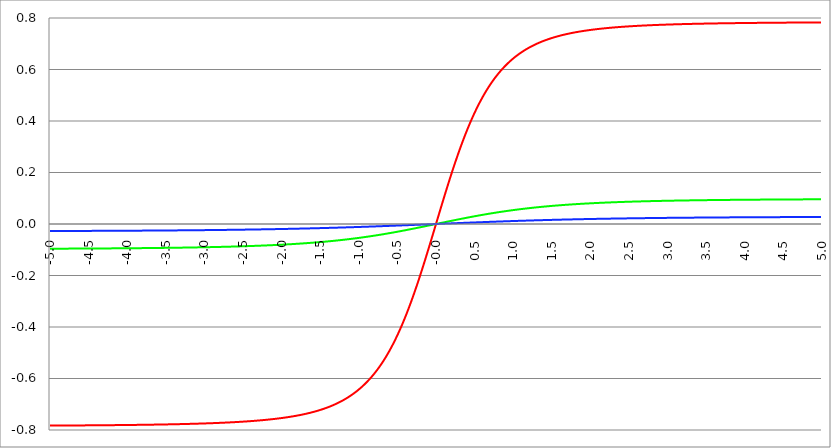
| Category | Series 1 | Series 0 | Series 2 |
|---|---|---|---|
| -5.0 | -0.783 | -0.096 | -0.027 |
| -4.995 | -0.783 | -0.096 | -0.027 |
| -4.99 | -0.783 | -0.096 | -0.027 |
| -4.985 | -0.783 | -0.096 | -0.027 |
| -4.98 | -0.783 | -0.096 | -0.027 |
| -4.975 | -0.783 | -0.096 | -0.027 |
| -4.97 | -0.783 | -0.096 | -0.027 |
| -4.965000000000001 | -0.783 | -0.096 | -0.027 |
| -4.960000000000001 | -0.783 | -0.096 | -0.027 |
| -4.955000000000001 | -0.783 | -0.096 | -0.027 |
| -4.950000000000001 | -0.783 | -0.096 | -0.027 |
| -4.945000000000001 | -0.783 | -0.096 | -0.027 |
| -4.940000000000001 | -0.783 | -0.096 | -0.027 |
| -4.935000000000001 | -0.783 | -0.096 | -0.027 |
| -4.930000000000001 | -0.783 | -0.096 | -0.027 |
| -4.925000000000002 | -0.783 | -0.096 | -0.027 |
| -4.920000000000002 | -0.783 | -0.096 | -0.027 |
| -4.915000000000002 | -0.783 | -0.096 | -0.027 |
| -4.910000000000002 | -0.783 | -0.096 | -0.027 |
| -4.905000000000002 | -0.783 | -0.096 | -0.027 |
| -4.900000000000002 | -0.783 | -0.096 | -0.027 |
| -4.895000000000002 | -0.783 | -0.096 | -0.027 |
| -4.890000000000002 | -0.783 | -0.096 | -0.027 |
| -4.885000000000002 | -0.783 | -0.096 | -0.027 |
| -4.880000000000002 | -0.783 | -0.096 | -0.027 |
| -4.875000000000003 | -0.783 | -0.096 | -0.027 |
| -4.870000000000003 | -0.783 | -0.096 | -0.027 |
| -4.865000000000003 | -0.783 | -0.096 | -0.027 |
| -4.860000000000003 | -0.783 | -0.096 | -0.027 |
| -4.855000000000003 | -0.783 | -0.096 | -0.027 |
| -4.850000000000003 | -0.783 | -0.096 | -0.027 |
| -4.845000000000003 | -0.783 | -0.096 | -0.027 |
| -4.840000000000003 | -0.783 | -0.096 | -0.027 |
| -4.835000000000003 | -0.783 | -0.096 | -0.027 |
| -4.830000000000004 | -0.783 | -0.096 | -0.027 |
| -4.825000000000004 | -0.783 | -0.096 | -0.027 |
| -4.820000000000004 | -0.783 | -0.096 | -0.027 |
| -4.815000000000004 | -0.783 | -0.096 | -0.027 |
| -4.810000000000004 | -0.783 | -0.096 | -0.027 |
| -4.805000000000004 | -0.783 | -0.096 | -0.027 |
| -4.800000000000004 | -0.783 | -0.096 | -0.027 |
| -4.795000000000004 | -0.783 | -0.096 | -0.027 |
| -4.790000000000004 | -0.783 | -0.096 | -0.027 |
| -4.785000000000004 | -0.783 | -0.096 | -0.027 |
| -4.780000000000004 | -0.782 | -0.096 | -0.027 |
| -4.775000000000004 | -0.782 | -0.096 | -0.027 |
| -4.770000000000004 | -0.782 | -0.096 | -0.027 |
| -4.765000000000005 | -0.782 | -0.096 | -0.027 |
| -4.760000000000005 | -0.782 | -0.096 | -0.027 |
| -4.755000000000005 | -0.782 | -0.096 | -0.027 |
| -4.750000000000005 | -0.782 | -0.096 | -0.027 |
| -4.745000000000005 | -0.782 | -0.096 | -0.027 |
| -4.740000000000005 | -0.782 | -0.096 | -0.027 |
| -4.735000000000005 | -0.782 | -0.096 | -0.027 |
| -4.730000000000005 | -0.782 | -0.096 | -0.027 |
| -4.725000000000006 | -0.782 | -0.096 | -0.027 |
| -4.720000000000006 | -0.782 | -0.096 | -0.027 |
| -4.715000000000006 | -0.782 | -0.096 | -0.027 |
| -4.710000000000006 | -0.782 | -0.096 | -0.027 |
| -4.705000000000006 | -0.782 | -0.096 | -0.027 |
| -4.700000000000006 | -0.782 | -0.096 | -0.027 |
| -4.695000000000006 | -0.782 | -0.096 | -0.027 |
| -4.690000000000006 | -0.782 | -0.096 | -0.027 |
| -4.685000000000007 | -0.782 | -0.096 | -0.027 |
| -4.680000000000007 | -0.782 | -0.096 | -0.027 |
| -4.675000000000007 | -0.782 | -0.096 | -0.027 |
| -4.670000000000007 | -0.782 | -0.096 | -0.027 |
| -4.665000000000007 | -0.782 | -0.095 | -0.027 |
| -4.660000000000007 | -0.782 | -0.095 | -0.027 |
| -4.655000000000007 | -0.782 | -0.095 | -0.027 |
| -4.650000000000007 | -0.782 | -0.095 | -0.027 |
| -4.645000000000007 | -0.782 | -0.095 | -0.027 |
| -4.640000000000008 | -0.782 | -0.095 | -0.027 |
| -4.635000000000008 | -0.782 | -0.095 | -0.027 |
| -4.630000000000008 | -0.782 | -0.095 | -0.027 |
| -4.625000000000008 | -0.782 | -0.095 | -0.027 |
| -4.620000000000008 | -0.782 | -0.095 | -0.027 |
| -4.615000000000008 | -0.782 | -0.095 | -0.027 |
| -4.610000000000008 | -0.782 | -0.095 | -0.027 |
| -4.605000000000008 | -0.782 | -0.095 | -0.027 |
| -4.600000000000008 | -0.782 | -0.095 | -0.027 |
| -4.595000000000009 | -0.782 | -0.095 | -0.027 |
| -4.590000000000009 | -0.782 | -0.095 | -0.027 |
| -4.585000000000009 | -0.782 | -0.095 | -0.027 |
| -4.580000000000009 | -0.782 | -0.095 | -0.027 |
| -4.57500000000001 | -0.782 | -0.095 | -0.027 |
| -4.57000000000001 | -0.782 | -0.095 | -0.027 |
| -4.565000000000009 | -0.782 | -0.095 | -0.027 |
| -4.560000000000009 | -0.782 | -0.095 | -0.027 |
| -4.555000000000009 | -0.782 | -0.095 | -0.027 |
| -4.55000000000001 | -0.782 | -0.095 | -0.027 |
| -4.54500000000001 | -0.782 | -0.095 | -0.027 |
| -4.54000000000001 | -0.782 | -0.095 | -0.027 |
| -4.53500000000001 | -0.782 | -0.095 | -0.027 |
| -4.53000000000001 | -0.782 | -0.095 | -0.027 |
| -4.52500000000001 | -0.782 | -0.095 | -0.027 |
| -4.52000000000001 | -0.782 | -0.095 | -0.027 |
| -4.51500000000001 | -0.782 | -0.095 | -0.027 |
| -4.51000000000001 | -0.782 | -0.095 | -0.027 |
| -4.505000000000011 | -0.782 | -0.095 | -0.027 |
| -4.500000000000011 | -0.782 | -0.095 | -0.027 |
| -4.495000000000011 | -0.782 | -0.095 | -0.027 |
| -4.490000000000011 | -0.782 | -0.095 | -0.027 |
| -4.485000000000011 | -0.782 | -0.095 | -0.027 |
| -4.480000000000011 | -0.782 | -0.095 | -0.027 |
| -4.475000000000011 | -0.782 | -0.095 | -0.027 |
| -4.470000000000011 | -0.782 | -0.095 | -0.027 |
| -4.465000000000011 | -0.782 | -0.095 | -0.027 |
| -4.460000000000011 | -0.782 | -0.095 | -0.027 |
| -4.455000000000012 | -0.782 | -0.095 | -0.027 |
| -4.450000000000012 | -0.782 | -0.095 | -0.027 |
| -4.445000000000012 | -0.782 | -0.095 | -0.027 |
| -4.440000000000012 | -0.782 | -0.095 | -0.027 |
| -4.435000000000012 | -0.782 | -0.095 | -0.027 |
| -4.430000000000012 | -0.782 | -0.095 | -0.027 |
| -4.425000000000012 | -0.782 | -0.095 | -0.027 |
| -4.420000000000012 | -0.782 | -0.095 | -0.027 |
| -4.415000000000012 | -0.782 | -0.095 | -0.027 |
| -4.410000000000013 | -0.782 | -0.095 | -0.027 |
| -4.405000000000013 | -0.782 | -0.095 | -0.027 |
| -4.400000000000013 | -0.782 | -0.095 | -0.027 |
| -4.395000000000013 | -0.782 | -0.095 | -0.027 |
| -4.390000000000013 | -0.782 | -0.095 | -0.027 |
| -4.385000000000013 | -0.782 | -0.095 | -0.027 |
| -4.380000000000013 | -0.782 | -0.095 | -0.027 |
| -4.375000000000013 | -0.782 | -0.095 | -0.027 |
| -4.370000000000013 | -0.782 | -0.095 | -0.027 |
| -4.365000000000013 | -0.782 | -0.095 | -0.027 |
| -4.360000000000014 | -0.782 | -0.095 | -0.027 |
| -4.355000000000014 | -0.782 | -0.095 | -0.027 |
| -4.350000000000014 | -0.782 | -0.095 | -0.027 |
| -4.345000000000014 | -0.782 | -0.095 | -0.027 |
| -4.340000000000014 | -0.782 | -0.095 | -0.027 |
| -4.335000000000014 | -0.782 | -0.095 | -0.027 |
| -4.330000000000014 | -0.782 | -0.095 | -0.027 |
| -4.325000000000014 | -0.782 | -0.095 | -0.027 |
| -4.320000000000014 | -0.782 | -0.095 | -0.027 |
| -4.315000000000015 | -0.782 | -0.095 | -0.027 |
| -4.310000000000015 | -0.781 | -0.095 | -0.027 |
| -4.305000000000015 | -0.781 | -0.095 | -0.027 |
| -4.300000000000015 | -0.781 | -0.095 | -0.026 |
| -4.295000000000015 | -0.781 | -0.095 | -0.026 |
| -4.290000000000015 | -0.781 | -0.095 | -0.026 |
| -4.285000000000015 | -0.781 | -0.095 | -0.026 |
| -4.280000000000015 | -0.781 | -0.095 | -0.026 |
| -4.275000000000015 | -0.781 | -0.095 | -0.026 |
| -4.270000000000015 | -0.781 | -0.095 | -0.026 |
| -4.265000000000016 | -0.781 | -0.095 | -0.026 |
| -4.260000000000016 | -0.781 | -0.095 | -0.026 |
| -4.255000000000016 | -0.781 | -0.095 | -0.026 |
| -4.250000000000016 | -0.781 | -0.095 | -0.026 |
| -4.245000000000016 | -0.781 | -0.095 | -0.026 |
| -4.240000000000016 | -0.781 | -0.095 | -0.026 |
| -4.235000000000016 | -0.781 | -0.095 | -0.026 |
| -4.230000000000016 | -0.781 | -0.095 | -0.026 |
| -4.225000000000017 | -0.781 | -0.095 | -0.026 |
| -4.220000000000017 | -0.781 | -0.095 | -0.026 |
| -4.215000000000017 | -0.781 | -0.095 | -0.026 |
| -4.210000000000017 | -0.781 | -0.095 | -0.026 |
| -4.205000000000017 | -0.781 | -0.095 | -0.026 |
| -4.200000000000017 | -0.781 | -0.095 | -0.026 |
| -4.195000000000017 | -0.781 | -0.095 | -0.026 |
| -4.190000000000017 | -0.781 | -0.095 | -0.026 |
| -4.185000000000017 | -0.781 | -0.095 | -0.026 |
| -4.180000000000017 | -0.781 | -0.095 | -0.026 |
| -4.175000000000018 | -0.781 | -0.095 | -0.026 |
| -4.170000000000018 | -0.781 | -0.095 | -0.026 |
| -4.165000000000018 | -0.781 | -0.095 | -0.026 |
| -4.160000000000018 | -0.781 | -0.095 | -0.026 |
| -4.155000000000018 | -0.781 | -0.095 | -0.026 |
| -4.150000000000018 | -0.781 | -0.095 | -0.026 |
| -4.145000000000018 | -0.781 | -0.095 | -0.026 |
| -4.140000000000018 | -0.781 | -0.095 | -0.026 |
| -4.135000000000018 | -0.781 | -0.095 | -0.026 |
| -4.130000000000019 | -0.781 | -0.095 | -0.026 |
| -4.125000000000019 | -0.781 | -0.094 | -0.026 |
| -4.120000000000019 | -0.781 | -0.094 | -0.026 |
| -4.115000000000019 | -0.781 | -0.094 | -0.026 |
| -4.110000000000019 | -0.781 | -0.094 | -0.026 |
| -4.105000000000019 | -0.781 | -0.094 | -0.026 |
| -4.100000000000019 | -0.781 | -0.094 | -0.026 |
| -4.095000000000019 | -0.781 | -0.094 | -0.026 |
| -4.090000000000019 | -0.781 | -0.094 | -0.026 |
| -4.085000000000019 | -0.781 | -0.094 | -0.026 |
| -4.08000000000002 | -0.781 | -0.094 | -0.026 |
| -4.07500000000002 | -0.781 | -0.094 | -0.026 |
| -4.07000000000002 | -0.781 | -0.094 | -0.026 |
| -4.06500000000002 | -0.781 | -0.094 | -0.026 |
| -4.06000000000002 | -0.781 | -0.094 | -0.026 |
| -4.05500000000002 | -0.781 | -0.094 | -0.026 |
| -4.05000000000002 | -0.781 | -0.094 | -0.026 |
| -4.04500000000002 | -0.781 | -0.094 | -0.026 |
| -4.04000000000002 | -0.781 | -0.094 | -0.026 |
| -4.03500000000002 | -0.781 | -0.094 | -0.026 |
| -4.03000000000002 | -0.781 | -0.094 | -0.026 |
| -4.025000000000021 | -0.781 | -0.094 | -0.026 |
| -4.020000000000021 | -0.781 | -0.094 | -0.026 |
| -4.015000000000021 | -0.781 | -0.094 | -0.026 |
| -4.010000000000021 | -0.781 | -0.094 | -0.026 |
| -4.005000000000021 | -0.781 | -0.094 | -0.026 |
| -4.000000000000021 | -0.781 | -0.094 | -0.026 |
| -3.995000000000021 | -0.781 | -0.094 | -0.026 |
| -3.990000000000021 | -0.781 | -0.094 | -0.026 |
| -3.985000000000022 | -0.781 | -0.094 | -0.026 |
| -3.980000000000022 | -0.78 | -0.094 | -0.026 |
| -3.975000000000022 | -0.78 | -0.094 | -0.026 |
| -3.970000000000022 | -0.78 | -0.094 | -0.026 |
| -3.965000000000022 | -0.78 | -0.094 | -0.026 |
| -3.960000000000022 | -0.78 | -0.094 | -0.026 |
| -3.955000000000022 | -0.78 | -0.094 | -0.026 |
| -3.950000000000022 | -0.78 | -0.094 | -0.026 |
| -3.945000000000022 | -0.78 | -0.094 | -0.026 |
| -3.940000000000023 | -0.78 | -0.094 | -0.026 |
| -3.935000000000023 | -0.78 | -0.094 | -0.026 |
| -3.930000000000023 | -0.78 | -0.094 | -0.026 |
| -3.925000000000023 | -0.78 | -0.094 | -0.026 |
| -3.920000000000023 | -0.78 | -0.094 | -0.026 |
| -3.915000000000023 | -0.78 | -0.094 | -0.026 |
| -3.910000000000023 | -0.78 | -0.094 | -0.026 |
| -3.905000000000023 | -0.78 | -0.094 | -0.026 |
| -3.900000000000023 | -0.78 | -0.094 | -0.026 |
| -3.895000000000023 | -0.78 | -0.094 | -0.026 |
| -3.890000000000024 | -0.78 | -0.094 | -0.026 |
| -3.885000000000024 | -0.78 | -0.094 | -0.026 |
| -3.880000000000024 | -0.78 | -0.094 | -0.026 |
| -3.875000000000024 | -0.78 | -0.094 | -0.026 |
| -3.870000000000024 | -0.78 | -0.094 | -0.026 |
| -3.865000000000024 | -0.78 | -0.094 | -0.026 |
| -3.860000000000024 | -0.78 | -0.094 | -0.026 |
| -3.855000000000024 | -0.78 | -0.094 | -0.026 |
| -3.850000000000024 | -0.78 | -0.094 | -0.026 |
| -3.845000000000025 | -0.78 | -0.094 | -0.026 |
| -3.840000000000025 | -0.78 | -0.094 | -0.026 |
| -3.835000000000025 | -0.78 | -0.094 | -0.026 |
| -3.830000000000025 | -0.78 | -0.094 | -0.026 |
| -3.825000000000025 | -0.78 | -0.094 | -0.026 |
| -3.820000000000025 | -0.78 | -0.094 | -0.026 |
| -3.815000000000025 | -0.78 | -0.094 | -0.026 |
| -3.810000000000025 | -0.78 | -0.094 | -0.026 |
| -3.805000000000025 | -0.78 | -0.094 | -0.026 |
| -3.800000000000026 | -0.78 | -0.094 | -0.026 |
| -3.795000000000026 | -0.78 | -0.094 | -0.026 |
| -3.790000000000026 | -0.78 | -0.094 | -0.026 |
| -3.785000000000026 | -0.78 | -0.094 | -0.026 |
| -3.780000000000026 | -0.78 | -0.094 | -0.026 |
| -3.775000000000026 | -0.78 | -0.094 | -0.026 |
| -3.770000000000026 | -0.78 | -0.094 | -0.026 |
| -3.765000000000026 | -0.78 | -0.094 | -0.026 |
| -3.760000000000026 | -0.78 | -0.094 | -0.026 |
| -3.755000000000026 | -0.78 | -0.094 | -0.026 |
| -3.750000000000027 | -0.78 | -0.094 | -0.026 |
| -3.745000000000027 | -0.78 | -0.093 | -0.026 |
| -3.740000000000027 | -0.78 | -0.093 | -0.026 |
| -3.735000000000027 | -0.78 | -0.093 | -0.026 |
| -3.730000000000027 | -0.779 | -0.093 | -0.026 |
| -3.725000000000027 | -0.779 | -0.093 | -0.026 |
| -3.720000000000027 | -0.779 | -0.093 | -0.026 |
| -3.715000000000027 | -0.779 | -0.093 | -0.026 |
| -3.710000000000027 | -0.779 | -0.093 | -0.026 |
| -3.705000000000028 | -0.779 | -0.093 | -0.026 |
| -3.700000000000028 | -0.779 | -0.093 | -0.026 |
| -3.695000000000028 | -0.779 | -0.093 | -0.026 |
| -3.690000000000028 | -0.779 | -0.093 | -0.026 |
| -3.685000000000028 | -0.779 | -0.093 | -0.026 |
| -3.680000000000028 | -0.779 | -0.093 | -0.025 |
| -3.675000000000028 | -0.779 | -0.093 | -0.025 |
| -3.670000000000028 | -0.779 | -0.093 | -0.025 |
| -3.665000000000028 | -0.779 | -0.093 | -0.025 |
| -3.660000000000028 | -0.779 | -0.093 | -0.025 |
| -3.655000000000029 | -0.779 | -0.093 | -0.025 |
| -3.650000000000029 | -0.779 | -0.093 | -0.025 |
| -3.645000000000029 | -0.779 | -0.093 | -0.025 |
| -3.640000000000029 | -0.779 | -0.093 | -0.025 |
| -3.635000000000029 | -0.779 | -0.093 | -0.025 |
| -3.630000000000029 | -0.779 | -0.093 | -0.025 |
| -3.625000000000029 | -0.779 | -0.093 | -0.025 |
| -3.620000000000029 | -0.779 | -0.093 | -0.025 |
| -3.615000000000029 | -0.779 | -0.093 | -0.025 |
| -3.61000000000003 | -0.779 | -0.093 | -0.025 |
| -3.60500000000003 | -0.779 | -0.093 | -0.025 |
| -3.60000000000003 | -0.779 | -0.093 | -0.025 |
| -3.59500000000003 | -0.779 | -0.093 | -0.025 |
| -3.59000000000003 | -0.779 | -0.093 | -0.025 |
| -3.58500000000003 | -0.779 | -0.093 | -0.025 |
| -3.58000000000003 | -0.779 | -0.093 | -0.025 |
| -3.57500000000003 | -0.779 | -0.093 | -0.025 |
| -3.57000000000003 | -0.779 | -0.093 | -0.025 |
| -3.565000000000031 | -0.779 | -0.093 | -0.025 |
| -3.560000000000031 | -0.779 | -0.093 | -0.025 |
| -3.555000000000031 | -0.779 | -0.093 | -0.025 |
| -3.550000000000031 | -0.779 | -0.093 | -0.025 |
| -3.545000000000031 | -0.779 | -0.093 | -0.025 |
| -3.540000000000031 | -0.779 | -0.093 | -0.025 |
| -3.535000000000031 | -0.779 | -0.093 | -0.025 |
| -3.530000000000031 | -0.778 | -0.093 | -0.025 |
| -3.525000000000031 | -0.778 | -0.093 | -0.025 |
| -3.520000000000032 | -0.778 | -0.093 | -0.025 |
| -3.515000000000032 | -0.778 | -0.093 | -0.025 |
| -3.510000000000032 | -0.778 | -0.093 | -0.025 |
| -3.505000000000032 | -0.778 | -0.093 | -0.025 |
| -3.500000000000032 | -0.778 | -0.093 | -0.025 |
| -3.495000000000032 | -0.778 | -0.093 | -0.025 |
| -3.490000000000032 | -0.778 | -0.093 | -0.025 |
| -3.485000000000032 | -0.778 | -0.093 | -0.025 |
| -3.480000000000032 | -0.778 | -0.093 | -0.025 |
| -3.475000000000032 | -0.778 | -0.093 | -0.025 |
| -3.470000000000033 | -0.778 | -0.093 | -0.025 |
| -3.465000000000033 | -0.778 | -0.093 | -0.025 |
| -3.460000000000033 | -0.778 | -0.092 | -0.025 |
| -3.455000000000033 | -0.778 | -0.092 | -0.025 |
| -3.450000000000033 | -0.778 | -0.092 | -0.025 |
| -3.445000000000033 | -0.778 | -0.092 | -0.025 |
| -3.440000000000033 | -0.778 | -0.092 | -0.025 |
| -3.435000000000033 | -0.778 | -0.092 | -0.025 |
| -3.430000000000033 | -0.778 | -0.092 | -0.025 |
| -3.425000000000034 | -0.778 | -0.092 | -0.025 |
| -3.420000000000034 | -0.778 | -0.092 | -0.025 |
| -3.415000000000034 | -0.778 | -0.092 | -0.025 |
| -3.410000000000034 | -0.778 | -0.092 | -0.025 |
| -3.405000000000034 | -0.778 | -0.092 | -0.025 |
| -3.400000000000034 | -0.778 | -0.092 | -0.025 |
| -3.395000000000034 | -0.778 | -0.092 | -0.025 |
| -3.390000000000034 | -0.778 | -0.092 | -0.025 |
| -3.385000000000034 | -0.778 | -0.092 | -0.025 |
| -3.380000000000034 | -0.778 | -0.092 | -0.025 |
| -3.375000000000035 | -0.778 | -0.092 | -0.025 |
| -3.370000000000035 | -0.778 | -0.092 | -0.025 |
| -3.365000000000035 | -0.777 | -0.092 | -0.025 |
| -3.360000000000035 | -0.777 | -0.092 | -0.025 |
| -3.355000000000035 | -0.777 | -0.092 | -0.025 |
| -3.350000000000035 | -0.777 | -0.092 | -0.025 |
| -3.345000000000035 | -0.777 | -0.092 | -0.025 |
| -3.340000000000035 | -0.777 | -0.092 | -0.025 |
| -3.335000000000035 | -0.777 | -0.092 | -0.025 |
| -3.330000000000036 | -0.777 | -0.092 | -0.025 |
| -3.325000000000036 | -0.777 | -0.092 | -0.025 |
| -3.320000000000036 | -0.777 | -0.092 | -0.025 |
| -3.315000000000036 | -0.777 | -0.092 | -0.025 |
| -3.310000000000036 | -0.777 | -0.092 | -0.025 |
| -3.305000000000036 | -0.777 | -0.092 | -0.025 |
| -3.300000000000036 | -0.777 | -0.092 | -0.025 |
| -3.295000000000036 | -0.777 | -0.092 | -0.025 |
| -3.290000000000036 | -0.777 | -0.092 | -0.025 |
| -3.285000000000036 | -0.777 | -0.092 | -0.025 |
| -3.280000000000036 | -0.777 | -0.092 | -0.025 |
| -3.275000000000037 | -0.777 | -0.092 | -0.025 |
| -3.270000000000037 | -0.777 | -0.092 | -0.025 |
| -3.265000000000037 | -0.777 | -0.092 | -0.025 |
| -3.260000000000037 | -0.777 | -0.092 | -0.025 |
| -3.255000000000037 | -0.777 | -0.092 | -0.025 |
| -3.250000000000037 | -0.777 | -0.092 | -0.025 |
| -3.245000000000037 | -0.777 | -0.092 | -0.025 |
| -3.240000000000037 | -0.777 | -0.092 | -0.024 |
| -3.235000000000038 | -0.777 | -0.092 | -0.024 |
| -3.230000000000038 | -0.777 | -0.091 | -0.024 |
| -3.225000000000038 | -0.776 | -0.091 | -0.024 |
| -3.220000000000038 | -0.776 | -0.091 | -0.024 |
| -3.215000000000038 | -0.776 | -0.091 | -0.024 |
| -3.210000000000038 | -0.776 | -0.091 | -0.024 |
| -3.205000000000038 | -0.776 | -0.091 | -0.024 |
| -3.200000000000038 | -0.776 | -0.091 | -0.024 |
| -3.195000000000038 | -0.776 | -0.091 | -0.024 |
| -3.190000000000039 | -0.776 | -0.091 | -0.024 |
| -3.185000000000039 | -0.776 | -0.091 | -0.024 |
| -3.180000000000039 | -0.776 | -0.091 | -0.024 |
| -3.175000000000039 | -0.776 | -0.091 | -0.024 |
| -3.170000000000039 | -0.776 | -0.091 | -0.024 |
| -3.16500000000004 | -0.776 | -0.091 | -0.024 |
| -3.16000000000004 | -0.776 | -0.091 | -0.024 |
| -3.155000000000039 | -0.776 | -0.091 | -0.024 |
| -3.150000000000039 | -0.776 | -0.091 | -0.024 |
| -3.14500000000004 | -0.776 | -0.091 | -0.024 |
| -3.14000000000004 | -0.776 | -0.091 | -0.024 |
| -3.13500000000004 | -0.776 | -0.091 | -0.024 |
| -3.13000000000004 | -0.776 | -0.091 | -0.024 |
| -3.12500000000004 | -0.776 | -0.091 | -0.024 |
| -3.12000000000004 | -0.776 | -0.091 | -0.024 |
| -3.11500000000004 | -0.776 | -0.091 | -0.024 |
| -3.11000000000004 | -0.776 | -0.091 | -0.024 |
| -3.10500000000004 | -0.776 | -0.091 | -0.024 |
| -3.10000000000004 | -0.775 | -0.091 | -0.024 |
| -3.095000000000041 | -0.775 | -0.091 | -0.024 |
| -3.090000000000041 | -0.775 | -0.091 | -0.024 |
| -3.085000000000041 | -0.775 | -0.091 | -0.024 |
| -3.080000000000041 | -0.775 | -0.091 | -0.024 |
| -3.075000000000041 | -0.775 | -0.091 | -0.024 |
| -3.070000000000041 | -0.775 | -0.091 | -0.024 |
| -3.065000000000041 | -0.775 | -0.091 | -0.024 |
| -3.060000000000041 | -0.775 | -0.091 | -0.024 |
| -3.055000000000041 | -0.775 | -0.091 | -0.024 |
| -3.050000000000042 | -0.775 | -0.091 | -0.024 |
| -3.045000000000042 | -0.775 | -0.091 | -0.024 |
| -3.040000000000042 | -0.775 | -0.091 | -0.024 |
| -3.035000000000042 | -0.775 | -0.09 | -0.024 |
| -3.030000000000042 | -0.775 | -0.09 | -0.024 |
| -3.025000000000042 | -0.775 | -0.09 | -0.024 |
| -3.020000000000042 | -0.775 | -0.09 | -0.024 |
| -3.015000000000042 | -0.775 | -0.09 | -0.024 |
| -3.010000000000042 | -0.775 | -0.09 | -0.024 |
| -3.005000000000043 | -0.775 | -0.09 | -0.024 |
| -3.000000000000043 | -0.775 | -0.09 | -0.024 |
| -2.995000000000043 | -0.774 | -0.09 | -0.024 |
| -2.990000000000043 | -0.774 | -0.09 | -0.024 |
| -2.985000000000043 | -0.774 | -0.09 | -0.024 |
| -2.980000000000043 | -0.774 | -0.09 | -0.024 |
| -2.975000000000043 | -0.774 | -0.09 | -0.024 |
| -2.970000000000043 | -0.774 | -0.09 | -0.024 |
| -2.965000000000043 | -0.774 | -0.09 | -0.024 |
| -2.960000000000043 | -0.774 | -0.09 | -0.024 |
| -2.955000000000044 | -0.774 | -0.09 | -0.024 |
| -2.950000000000044 | -0.774 | -0.09 | -0.024 |
| -2.945000000000044 | -0.774 | -0.09 | -0.024 |
| -2.940000000000044 | -0.774 | -0.09 | -0.024 |
| -2.935000000000044 | -0.774 | -0.09 | -0.024 |
| -2.930000000000044 | -0.774 | -0.09 | -0.024 |
| -2.925000000000044 | -0.774 | -0.09 | -0.024 |
| -2.920000000000044 | -0.774 | -0.09 | -0.024 |
| -2.915000000000044 | -0.774 | -0.09 | -0.024 |
| -2.910000000000045 | -0.774 | -0.09 | -0.024 |
| -2.905000000000045 | -0.774 | -0.09 | -0.024 |
| -2.900000000000045 | -0.773 | -0.09 | -0.023 |
| -2.895000000000045 | -0.773 | -0.09 | -0.023 |
| -2.890000000000045 | -0.773 | -0.09 | -0.023 |
| -2.885000000000045 | -0.773 | -0.09 | -0.023 |
| -2.880000000000045 | -0.773 | -0.09 | -0.023 |
| -2.875000000000045 | -0.773 | -0.089 | -0.023 |
| -2.870000000000045 | -0.773 | -0.089 | -0.023 |
| -2.865000000000045 | -0.773 | -0.089 | -0.023 |
| -2.860000000000046 | -0.773 | -0.089 | -0.023 |
| -2.855000000000046 | -0.773 | -0.089 | -0.023 |
| -2.850000000000046 | -0.773 | -0.089 | -0.023 |
| -2.845000000000046 | -0.773 | -0.089 | -0.023 |
| -2.840000000000046 | -0.773 | -0.089 | -0.023 |
| -2.835000000000046 | -0.773 | -0.089 | -0.023 |
| -2.830000000000046 | -0.773 | -0.089 | -0.023 |
| -2.825000000000046 | -0.773 | -0.089 | -0.023 |
| -2.820000000000046 | -0.773 | -0.089 | -0.023 |
| -2.815000000000047 | -0.772 | -0.089 | -0.023 |
| -2.810000000000047 | -0.772 | -0.089 | -0.023 |
| -2.805000000000047 | -0.772 | -0.089 | -0.023 |
| -2.800000000000047 | -0.772 | -0.089 | -0.023 |
| -2.795000000000047 | -0.772 | -0.089 | -0.023 |
| -2.790000000000047 | -0.772 | -0.089 | -0.023 |
| -2.785000000000047 | -0.772 | -0.089 | -0.023 |
| -2.780000000000047 | -0.772 | -0.089 | -0.023 |
| -2.775000000000047 | -0.772 | -0.089 | -0.023 |
| -2.770000000000047 | -0.772 | -0.089 | -0.023 |
| -2.765000000000048 | -0.772 | -0.089 | -0.023 |
| -2.760000000000048 | -0.772 | -0.089 | -0.023 |
| -2.755000000000048 | -0.772 | -0.089 | -0.023 |
| -2.750000000000048 | -0.772 | -0.089 | -0.023 |
| -2.745000000000048 | -0.772 | -0.089 | -0.023 |
| -2.740000000000048 | -0.771 | -0.089 | -0.023 |
| -2.735000000000048 | -0.771 | -0.088 | -0.023 |
| -2.730000000000048 | -0.771 | -0.088 | -0.023 |
| -2.725000000000048 | -0.771 | -0.088 | -0.023 |
| -2.720000000000049 | -0.771 | -0.088 | -0.023 |
| -2.715000000000049 | -0.771 | -0.088 | -0.023 |
| -2.710000000000049 | -0.771 | -0.088 | -0.023 |
| -2.705000000000049 | -0.771 | -0.088 | -0.023 |
| -2.700000000000049 | -0.771 | -0.088 | -0.023 |
| -2.695000000000049 | -0.771 | -0.088 | -0.023 |
| -2.690000000000049 | -0.771 | -0.088 | -0.023 |
| -2.685000000000049 | -0.771 | -0.088 | -0.023 |
| -2.680000000000049 | -0.771 | -0.088 | -0.023 |
| -2.675000000000049 | -0.771 | -0.088 | -0.023 |
| -2.67000000000005 | -0.77 | -0.088 | -0.023 |
| -2.66500000000005 | -0.77 | -0.088 | -0.023 |
| -2.66000000000005 | -0.77 | -0.088 | -0.023 |
| -2.65500000000005 | -0.77 | -0.088 | -0.023 |
| -2.65000000000005 | -0.77 | -0.088 | -0.023 |
| -2.64500000000005 | -0.77 | -0.088 | -0.023 |
| -2.64000000000005 | -0.77 | -0.088 | -0.023 |
| -2.63500000000005 | -0.77 | -0.088 | -0.023 |
| -2.63000000000005 | -0.77 | -0.088 | -0.023 |
| -2.625000000000051 | -0.77 | -0.088 | -0.022 |
| -2.620000000000051 | -0.77 | -0.088 | -0.022 |
| -2.615000000000051 | -0.77 | -0.088 | -0.022 |
| -2.610000000000051 | -0.77 | -0.087 | -0.022 |
| -2.605000000000051 | -0.769 | -0.087 | -0.022 |
| -2.600000000000051 | -0.769 | -0.087 | -0.022 |
| -2.595000000000051 | -0.769 | -0.087 | -0.022 |
| -2.590000000000051 | -0.769 | -0.087 | -0.022 |
| -2.585000000000051 | -0.769 | -0.087 | -0.022 |
| -2.580000000000052 | -0.769 | -0.087 | -0.022 |
| -2.575000000000052 | -0.769 | -0.087 | -0.022 |
| -2.570000000000052 | -0.769 | -0.087 | -0.022 |
| -2.565000000000052 | -0.769 | -0.087 | -0.022 |
| -2.560000000000052 | -0.769 | -0.087 | -0.022 |
| -2.555000000000052 | -0.769 | -0.087 | -0.022 |
| -2.550000000000052 | -0.768 | -0.087 | -0.022 |
| -2.545000000000052 | -0.768 | -0.087 | -0.022 |
| -2.540000000000052 | -0.768 | -0.087 | -0.022 |
| -2.535000000000053 | -0.768 | -0.087 | -0.022 |
| -2.530000000000053 | -0.768 | -0.087 | -0.022 |
| -2.525000000000053 | -0.768 | -0.087 | -0.022 |
| -2.520000000000053 | -0.768 | -0.087 | -0.022 |
| -2.515000000000053 | -0.768 | -0.087 | -0.022 |
| -2.510000000000053 | -0.768 | -0.087 | -0.022 |
| -2.505000000000053 | -0.768 | -0.087 | -0.022 |
| -2.500000000000053 | -0.768 | -0.086 | -0.022 |
| -2.495000000000053 | -0.767 | -0.086 | -0.022 |
| -2.490000000000053 | -0.767 | -0.086 | -0.022 |
| -2.485000000000054 | -0.767 | -0.086 | -0.022 |
| -2.480000000000054 | -0.767 | -0.086 | -0.022 |
| -2.475000000000054 | -0.767 | -0.086 | -0.022 |
| -2.470000000000054 | -0.767 | -0.086 | -0.022 |
| -2.465000000000054 | -0.767 | -0.086 | -0.022 |
| -2.460000000000054 | -0.767 | -0.086 | -0.022 |
| -2.455000000000054 | -0.767 | -0.086 | -0.022 |
| -2.450000000000054 | -0.767 | -0.086 | -0.022 |
| -2.445000000000054 | -0.766 | -0.086 | -0.022 |
| -2.440000000000055 | -0.766 | -0.086 | -0.022 |
| -2.435000000000055 | -0.766 | -0.086 | -0.022 |
| -2.430000000000055 | -0.766 | -0.086 | -0.022 |
| -2.425000000000055 | -0.766 | -0.086 | -0.022 |
| -2.420000000000055 | -0.766 | -0.086 | -0.022 |
| -2.415000000000055 | -0.766 | -0.086 | -0.022 |
| -2.410000000000055 | -0.766 | -0.086 | -0.022 |
| -2.405000000000055 | -0.766 | -0.086 | -0.022 |
| -2.400000000000055 | -0.766 | -0.085 | -0.022 |
| -2.395000000000055 | -0.765 | -0.085 | -0.022 |
| -2.390000000000056 | -0.765 | -0.085 | -0.021 |
| -2.385000000000056 | -0.765 | -0.085 | -0.021 |
| -2.380000000000056 | -0.765 | -0.085 | -0.021 |
| -2.375000000000056 | -0.765 | -0.085 | -0.021 |
| -2.370000000000056 | -0.765 | -0.085 | -0.021 |
| -2.365000000000056 | -0.765 | -0.085 | -0.021 |
| -2.360000000000056 | -0.765 | -0.085 | -0.021 |
| -2.355000000000056 | -0.765 | -0.085 | -0.021 |
| -2.350000000000056 | -0.764 | -0.085 | -0.021 |
| -2.345000000000057 | -0.764 | -0.085 | -0.021 |
| -2.340000000000057 | -0.764 | -0.085 | -0.021 |
| -2.335000000000057 | -0.764 | -0.085 | -0.021 |
| -2.330000000000057 | -0.764 | -0.085 | -0.021 |
| -2.325000000000057 | -0.764 | -0.085 | -0.021 |
| -2.320000000000057 | -0.764 | -0.085 | -0.021 |
| -2.315000000000057 | -0.764 | -0.085 | -0.021 |
| -2.310000000000057 | -0.763 | -0.085 | -0.021 |
| -2.305000000000057 | -0.763 | -0.084 | -0.021 |
| -2.300000000000058 | -0.763 | -0.084 | -0.021 |
| -2.295000000000058 | -0.763 | -0.084 | -0.021 |
| -2.290000000000058 | -0.763 | -0.084 | -0.021 |
| -2.285000000000058 | -0.763 | -0.084 | -0.021 |
| -2.280000000000058 | -0.763 | -0.084 | -0.021 |
| -2.275000000000058 | -0.763 | -0.084 | -0.021 |
| -2.270000000000058 | -0.762 | -0.084 | -0.021 |
| -2.265000000000058 | -0.762 | -0.084 | -0.021 |
| -2.260000000000058 | -0.762 | -0.084 | -0.021 |
| -2.255000000000058 | -0.762 | -0.084 | -0.021 |
| -2.250000000000059 | -0.762 | -0.084 | -0.021 |
| -2.245000000000059 | -0.762 | -0.084 | -0.021 |
| -2.240000000000059 | -0.762 | -0.084 | -0.021 |
| -2.235000000000059 | -0.761 | -0.084 | -0.021 |
| -2.23000000000006 | -0.761 | -0.084 | -0.021 |
| -2.22500000000006 | -0.761 | -0.083 | -0.021 |
| -2.22000000000006 | -0.761 | -0.083 | -0.021 |
| -2.215000000000059 | -0.761 | -0.083 | -0.021 |
| -2.210000000000059 | -0.761 | -0.083 | -0.021 |
| -2.20500000000006 | -0.761 | -0.083 | -0.021 |
| -2.20000000000006 | -0.76 | -0.083 | -0.021 |
| -2.19500000000006 | -0.76 | -0.083 | -0.021 |
| -2.19000000000006 | -0.76 | -0.083 | -0.02 |
| -2.18500000000006 | -0.76 | -0.083 | -0.02 |
| -2.18000000000006 | -0.76 | -0.083 | -0.02 |
| -2.17500000000006 | -0.76 | -0.083 | -0.02 |
| -2.17000000000006 | -0.76 | -0.083 | -0.02 |
| -2.16500000000006 | -0.759 | -0.083 | -0.02 |
| -2.160000000000061 | -0.759 | -0.083 | -0.02 |
| -2.155000000000061 | -0.759 | -0.083 | -0.02 |
| -2.150000000000061 | -0.759 | -0.083 | -0.02 |
| -2.145000000000061 | -0.759 | -0.082 | -0.02 |
| -2.140000000000061 | -0.759 | -0.082 | -0.02 |
| -2.135000000000061 | -0.758 | -0.082 | -0.02 |
| -2.130000000000061 | -0.758 | -0.082 | -0.02 |
| -2.125000000000061 | -0.758 | -0.082 | -0.02 |
| -2.120000000000061 | -0.758 | -0.082 | -0.02 |
| -2.115000000000061 | -0.758 | -0.082 | -0.02 |
| -2.110000000000062 | -0.758 | -0.082 | -0.02 |
| -2.105000000000062 | -0.757 | -0.082 | -0.02 |
| -2.100000000000062 | -0.757 | -0.082 | -0.02 |
| -2.095000000000062 | -0.757 | -0.082 | -0.02 |
| -2.090000000000062 | -0.757 | -0.082 | -0.02 |
| -2.085000000000062 | -0.757 | -0.082 | -0.02 |
| -2.080000000000062 | -0.757 | -0.082 | -0.02 |
| -2.075000000000062 | -0.756 | -0.081 | -0.02 |
| -2.070000000000062 | -0.756 | -0.081 | -0.02 |
| -2.065000000000063 | -0.756 | -0.081 | -0.02 |
| -2.060000000000063 | -0.756 | -0.081 | -0.02 |
| -2.055000000000063 | -0.756 | -0.081 | -0.02 |
| -2.050000000000063 | -0.755 | -0.081 | -0.02 |
| -2.045000000000063 | -0.755 | -0.081 | -0.02 |
| -2.040000000000063 | -0.755 | -0.081 | -0.02 |
| -2.035000000000063 | -0.755 | -0.081 | -0.02 |
| -2.030000000000063 | -0.755 | -0.081 | -0.02 |
| -2.025000000000063 | -0.755 | -0.081 | -0.02 |
| -2.020000000000064 | -0.754 | -0.081 | -0.02 |
| -2.015000000000064 | -0.754 | -0.081 | -0.02 |
| -2.010000000000064 | -0.754 | -0.08 | -0.019 |
| -2.005000000000064 | -0.754 | -0.08 | -0.019 |
| -2.000000000000064 | -0.754 | -0.08 | -0.019 |
| -1.995000000000064 | -0.753 | -0.08 | -0.019 |
| -1.990000000000064 | -0.753 | -0.08 | -0.019 |
| -1.985000000000064 | -0.753 | -0.08 | -0.019 |
| -1.980000000000064 | -0.753 | -0.08 | -0.019 |
| -1.975000000000064 | -0.753 | -0.08 | -0.019 |
| -1.970000000000065 | -0.752 | -0.08 | -0.019 |
| -1.965000000000065 | -0.752 | -0.08 | -0.019 |
| -1.960000000000065 | -0.752 | -0.08 | -0.019 |
| -1.955000000000065 | -0.752 | -0.08 | -0.019 |
| -1.950000000000065 | -0.751 | -0.08 | -0.019 |
| -1.945000000000065 | -0.751 | -0.079 | -0.019 |
| -1.940000000000065 | -0.751 | -0.079 | -0.019 |
| -1.935000000000065 | -0.751 | -0.079 | -0.019 |
| -1.930000000000065 | -0.751 | -0.079 | -0.019 |
| -1.925000000000066 | -0.75 | -0.079 | -0.019 |
| -1.920000000000066 | -0.75 | -0.079 | -0.019 |
| -1.915000000000066 | -0.75 | -0.079 | -0.019 |
| -1.910000000000066 | -0.75 | -0.079 | -0.019 |
| -1.905000000000066 | -0.749 | -0.079 | -0.019 |
| -1.900000000000066 | -0.749 | -0.079 | -0.019 |
| -1.895000000000066 | -0.749 | -0.079 | -0.019 |
| -1.890000000000066 | -0.749 | -0.079 | -0.019 |
| -1.885000000000066 | -0.749 | -0.078 | -0.019 |
| -1.880000000000066 | -0.748 | -0.078 | -0.019 |
| -1.875000000000067 | -0.748 | -0.078 | -0.019 |
| -1.870000000000067 | -0.748 | -0.078 | -0.019 |
| -1.865000000000067 | -0.748 | -0.078 | -0.019 |
| -1.860000000000067 | -0.747 | -0.078 | -0.019 |
| -1.855000000000067 | -0.747 | -0.078 | -0.019 |
| -1.850000000000067 | -0.747 | -0.078 | -0.019 |
| -1.845000000000067 | -0.747 | -0.078 | -0.018 |
| -1.840000000000067 | -0.746 | -0.078 | -0.018 |
| -1.835000000000067 | -0.746 | -0.078 | -0.018 |
| -1.830000000000068 | -0.746 | -0.077 | -0.018 |
| -1.825000000000068 | -0.745 | -0.077 | -0.018 |
| -1.820000000000068 | -0.745 | -0.077 | -0.018 |
| -1.815000000000068 | -0.745 | -0.077 | -0.018 |
| -1.810000000000068 | -0.745 | -0.077 | -0.018 |
| -1.805000000000068 | -0.744 | -0.077 | -0.018 |
| -1.800000000000068 | -0.744 | -0.077 | -0.018 |
| -1.795000000000068 | -0.744 | -0.077 | -0.018 |
| -1.790000000000068 | -0.744 | -0.077 | -0.018 |
| -1.785000000000068 | -0.743 | -0.077 | -0.018 |
| -1.780000000000069 | -0.743 | -0.076 | -0.018 |
| -1.775000000000069 | -0.743 | -0.076 | -0.018 |
| -1.770000000000069 | -0.742 | -0.076 | -0.018 |
| -1.765000000000069 | -0.742 | -0.076 | -0.018 |
| -1.760000000000069 | -0.742 | -0.076 | -0.018 |
| -1.75500000000007 | -0.742 | -0.076 | -0.018 |
| -1.75000000000007 | -0.741 | -0.076 | -0.018 |
| -1.745000000000069 | -0.741 | -0.076 | -0.018 |
| -1.740000000000069 | -0.741 | -0.076 | -0.018 |
| -1.73500000000007 | -0.74 | -0.076 | -0.018 |
| -1.73000000000007 | -0.74 | -0.075 | -0.018 |
| -1.72500000000007 | -0.74 | -0.075 | -0.018 |
| -1.72000000000007 | -0.739 | -0.075 | -0.018 |
| -1.71500000000007 | -0.739 | -0.075 | -0.018 |
| -1.71000000000007 | -0.739 | -0.075 | -0.018 |
| -1.70500000000007 | -0.738 | -0.075 | -0.018 |
| -1.70000000000007 | -0.738 | -0.075 | -0.017 |
| -1.69500000000007 | -0.738 | -0.075 | -0.017 |
| -1.69000000000007 | -0.737 | -0.075 | -0.017 |
| -1.685000000000071 | -0.737 | -0.075 | -0.017 |
| -1.680000000000071 | -0.737 | -0.074 | -0.017 |
| -1.675000000000071 | -0.736 | -0.074 | -0.017 |
| -1.670000000000071 | -0.736 | -0.074 | -0.017 |
| -1.665000000000071 | -0.736 | -0.074 | -0.017 |
| -1.660000000000071 | -0.735 | -0.074 | -0.017 |
| -1.655000000000071 | -0.735 | -0.074 | -0.017 |
| -1.650000000000071 | -0.735 | -0.074 | -0.017 |
| -1.645000000000071 | -0.734 | -0.074 | -0.017 |
| -1.640000000000072 | -0.734 | -0.074 | -0.017 |
| -1.635000000000072 | -0.733 | -0.073 | -0.017 |
| -1.630000000000072 | -0.733 | -0.073 | -0.017 |
| -1.625000000000072 | -0.733 | -0.073 | -0.017 |
| -1.620000000000072 | -0.732 | -0.073 | -0.017 |
| -1.615000000000072 | -0.732 | -0.073 | -0.017 |
| -1.610000000000072 | -0.732 | -0.073 | -0.017 |
| -1.605000000000072 | -0.731 | -0.073 | -0.017 |
| -1.600000000000072 | -0.731 | -0.073 | -0.017 |
| -1.595000000000073 | -0.73 | -0.073 | -0.017 |
| -1.590000000000073 | -0.73 | -0.072 | -0.017 |
| -1.585000000000073 | -0.73 | -0.072 | -0.017 |
| -1.580000000000073 | -0.729 | -0.072 | -0.017 |
| -1.575000000000073 | -0.729 | -0.072 | -0.017 |
| -1.570000000000073 | -0.728 | -0.072 | -0.017 |
| -1.565000000000073 | -0.728 | -0.072 | -0.016 |
| -1.560000000000073 | -0.728 | -0.072 | -0.016 |
| -1.555000000000073 | -0.727 | -0.072 | -0.016 |
| -1.550000000000074 | -0.727 | -0.071 | -0.016 |
| -1.545000000000074 | -0.726 | -0.071 | -0.016 |
| -1.540000000000074 | -0.726 | -0.071 | -0.016 |
| -1.535000000000074 | -0.725 | -0.071 | -0.016 |
| -1.530000000000074 | -0.725 | -0.071 | -0.016 |
| -1.525000000000074 | -0.724 | -0.071 | -0.016 |
| -1.520000000000074 | -0.724 | -0.071 | -0.016 |
| -1.515000000000074 | -0.724 | -0.071 | -0.016 |
| -1.510000000000074 | -0.723 | -0.07 | -0.016 |
| -1.505000000000074 | -0.723 | -0.07 | -0.016 |
| -1.500000000000075 | -0.722 | -0.07 | -0.016 |
| -1.495000000000075 | -0.722 | -0.07 | -0.016 |
| -1.490000000000075 | -0.721 | -0.07 | -0.016 |
| -1.485000000000075 | -0.721 | -0.07 | -0.016 |
| -1.480000000000075 | -0.72 | -0.07 | -0.016 |
| -1.475000000000075 | -0.72 | -0.07 | -0.016 |
| -1.470000000000075 | -0.719 | -0.069 | -0.016 |
| -1.465000000000075 | -0.719 | -0.069 | -0.016 |
| -1.460000000000075 | -0.718 | -0.069 | -0.016 |
| -1.455000000000076 | -0.718 | -0.069 | -0.016 |
| -1.450000000000076 | -0.717 | -0.069 | -0.016 |
| -1.445000000000076 | -0.717 | -0.069 | -0.016 |
| -1.440000000000076 | -0.716 | -0.069 | -0.016 |
| -1.435000000000076 | -0.716 | -0.069 | -0.015 |
| -1.430000000000076 | -0.715 | -0.068 | -0.015 |
| -1.425000000000076 | -0.715 | -0.068 | -0.015 |
| -1.420000000000076 | -0.714 | -0.068 | -0.015 |
| -1.415000000000076 | -0.713 | -0.068 | -0.015 |
| -1.410000000000077 | -0.713 | -0.068 | -0.015 |
| -1.405000000000077 | -0.712 | -0.068 | -0.015 |
| -1.400000000000077 | -0.712 | -0.068 | -0.015 |
| -1.395000000000077 | -0.711 | -0.067 | -0.015 |
| -1.390000000000077 | -0.711 | -0.067 | -0.015 |
| -1.385000000000077 | -0.71 | -0.067 | -0.015 |
| -1.380000000000077 | -0.709 | -0.067 | -0.015 |
| -1.375000000000077 | -0.709 | -0.067 | -0.015 |
| -1.370000000000077 | -0.708 | -0.067 | -0.015 |
| -1.365000000000077 | -0.708 | -0.067 | -0.015 |
| -1.360000000000078 | -0.707 | -0.066 | -0.015 |
| -1.355000000000078 | -0.706 | -0.066 | -0.015 |
| -1.350000000000078 | -0.706 | -0.066 | -0.015 |
| -1.345000000000078 | -0.705 | -0.066 | -0.015 |
| -1.340000000000078 | -0.705 | -0.066 | -0.015 |
| -1.335000000000078 | -0.704 | -0.066 | -0.015 |
| -1.330000000000078 | -0.703 | -0.065 | -0.015 |
| -1.325000000000078 | -0.703 | -0.065 | -0.015 |
| -1.320000000000078 | -0.702 | -0.065 | -0.015 |
| -1.315000000000079 | -0.701 | -0.065 | -0.014 |
| -1.310000000000079 | -0.701 | -0.065 | -0.014 |
| -1.305000000000079 | -0.7 | -0.065 | -0.014 |
| -1.300000000000079 | -0.699 | -0.065 | -0.014 |
| -1.295000000000079 | -0.698 | -0.064 | -0.014 |
| -1.29000000000008 | -0.698 | -0.064 | -0.014 |
| -1.285000000000079 | -0.697 | -0.064 | -0.014 |
| -1.280000000000079 | -0.696 | -0.064 | -0.014 |
| -1.275000000000079 | -0.696 | -0.064 | -0.014 |
| -1.270000000000079 | -0.695 | -0.064 | -0.014 |
| -1.26500000000008 | -0.694 | -0.063 | -0.014 |
| -1.26000000000008 | -0.693 | -0.063 | -0.014 |
| -1.25500000000008 | -0.693 | -0.063 | -0.014 |
| -1.25000000000008 | -0.692 | -0.063 | -0.014 |
| -1.24500000000008 | -0.691 | -0.063 | -0.014 |
| -1.24000000000008 | -0.69 | -0.063 | -0.014 |
| -1.23500000000008 | -0.69 | -0.063 | -0.014 |
| -1.23000000000008 | -0.689 | -0.062 | -0.014 |
| -1.22500000000008 | -0.688 | -0.062 | -0.014 |
| -1.220000000000081 | -0.687 | -0.062 | -0.014 |
| -1.215000000000081 | -0.686 | -0.062 | -0.014 |
| -1.210000000000081 | -0.686 | -0.062 | -0.014 |
| -1.205000000000081 | -0.685 | -0.062 | -0.013 |
| -1.200000000000081 | -0.684 | -0.061 | -0.013 |
| -1.195000000000081 | -0.683 | -0.061 | -0.013 |
| -1.190000000000081 | -0.682 | -0.061 | -0.013 |
| -1.185000000000081 | -0.681 | -0.061 | -0.013 |
| -1.180000000000081 | -0.681 | -0.061 | -0.013 |
| -1.175000000000082 | -0.68 | -0.06 | -0.013 |
| -1.170000000000082 | -0.679 | -0.06 | -0.013 |
| -1.165000000000082 | -0.678 | -0.06 | -0.013 |
| -1.160000000000082 | -0.677 | -0.06 | -0.013 |
| -1.155000000000082 | -0.676 | -0.06 | -0.013 |
| -1.150000000000082 | -0.675 | -0.06 | -0.013 |
| -1.145000000000082 | -0.674 | -0.059 | -0.013 |
| -1.140000000000082 | -0.673 | -0.059 | -0.013 |
| -1.135000000000082 | -0.672 | -0.059 | -0.013 |
| -1.130000000000082 | -0.671 | -0.059 | -0.013 |
| -1.125000000000083 | -0.67 | -0.059 | -0.013 |
| -1.120000000000083 | -0.669 | -0.059 | -0.013 |
| -1.115000000000083 | -0.668 | -0.058 | -0.013 |
| -1.110000000000083 | -0.667 | -0.058 | -0.013 |
| -1.105000000000083 | -0.666 | -0.058 | -0.013 |
| -1.100000000000083 | -0.665 | -0.058 | -0.012 |
| -1.095000000000083 | -0.664 | -0.058 | -0.012 |
| -1.090000000000083 | -0.663 | -0.057 | -0.012 |
| -1.085000000000083 | -0.662 | -0.057 | -0.012 |
| -1.080000000000084 | -0.661 | -0.057 | -0.012 |
| -1.075000000000084 | -0.66 | -0.057 | -0.012 |
| -1.070000000000084 | -0.659 | -0.057 | -0.012 |
| -1.065000000000084 | -0.658 | -0.057 | -0.012 |
| -1.060000000000084 | -0.657 | -0.056 | -0.012 |
| -1.055000000000084 | -0.656 | -0.056 | -0.012 |
| -1.050000000000084 | -0.655 | -0.056 | -0.012 |
| -1.045000000000084 | -0.653 | -0.056 | -0.012 |
| -1.040000000000084 | -0.652 | -0.056 | -0.012 |
| -1.035000000000085 | -0.651 | -0.055 | -0.012 |
| -1.030000000000085 | -0.65 | -0.055 | -0.012 |
| -1.025000000000085 | -0.649 | -0.055 | -0.012 |
| -1.020000000000085 | -0.648 | -0.055 | -0.012 |
| -1.015000000000085 | -0.646 | -0.055 | -0.012 |
| -1.010000000000085 | -0.645 | -0.054 | -0.012 |
| -1.005000000000085 | -0.644 | -0.054 | -0.012 |
| -1.000000000000085 | -0.643 | -0.054 | -0.012 |
| -0.995000000000085 | -0.641 | -0.054 | -0.011 |
| -0.990000000000085 | -0.64 | -0.054 | -0.011 |
| -0.985000000000085 | -0.639 | -0.053 | -0.011 |
| -0.980000000000085 | -0.638 | -0.053 | -0.011 |
| -0.975000000000085 | -0.636 | -0.053 | -0.011 |
| -0.970000000000085 | -0.635 | -0.053 | -0.011 |
| -0.965000000000085 | -0.634 | -0.053 | -0.011 |
| -0.960000000000085 | -0.632 | -0.052 | -0.011 |
| -0.955000000000085 | -0.631 | -0.052 | -0.011 |
| -0.950000000000085 | -0.63 | -0.052 | -0.011 |
| -0.945000000000085 | -0.628 | -0.052 | -0.011 |
| -0.940000000000085 | -0.627 | -0.052 | -0.011 |
| -0.935000000000085 | -0.625 | -0.051 | -0.011 |
| -0.930000000000085 | -0.624 | -0.051 | -0.011 |
| -0.925000000000085 | -0.622 | -0.051 | -0.011 |
| -0.920000000000085 | -0.621 | -0.051 | -0.011 |
| -0.915000000000085 | -0.62 | -0.05 | -0.011 |
| -0.910000000000085 | -0.618 | -0.05 | -0.011 |
| -0.905000000000085 | -0.617 | -0.05 | -0.011 |
| -0.900000000000085 | -0.615 | -0.05 | -0.01 |
| -0.895000000000085 | -0.613 | -0.05 | -0.01 |
| -0.890000000000085 | -0.612 | -0.049 | -0.01 |
| -0.885000000000085 | -0.61 | -0.049 | -0.01 |
| -0.880000000000085 | -0.609 | -0.049 | -0.01 |
| -0.875000000000085 | -0.607 | -0.049 | -0.01 |
| -0.870000000000085 | -0.606 | -0.049 | -0.01 |
| -0.865000000000085 | -0.604 | -0.048 | -0.01 |
| -0.860000000000085 | -0.602 | -0.048 | -0.01 |
| -0.855000000000085 | -0.601 | -0.048 | -0.01 |
| -0.850000000000085 | -0.599 | -0.048 | -0.01 |
| -0.845000000000085 | -0.597 | -0.047 | -0.01 |
| -0.840000000000085 | -0.596 | -0.047 | -0.01 |
| -0.835000000000085 | -0.594 | -0.047 | -0.01 |
| -0.830000000000085 | -0.592 | -0.047 | -0.01 |
| -0.825000000000085 | -0.59 | -0.046 | -0.01 |
| -0.820000000000085 | -0.589 | -0.046 | -0.01 |
| -0.815000000000085 | -0.587 | -0.046 | -0.01 |
| -0.810000000000085 | -0.585 | -0.046 | -0.01 |
| -0.805000000000085 | -0.583 | -0.046 | -0.009 |
| -0.800000000000085 | -0.581 | -0.045 | -0.009 |
| -0.795000000000085 | -0.579 | -0.045 | -0.009 |
| -0.790000000000085 | -0.578 | -0.045 | -0.009 |
| -0.785000000000085 | -0.576 | -0.045 | -0.009 |
| -0.780000000000085 | -0.574 | -0.044 | -0.009 |
| -0.775000000000085 | -0.572 | -0.044 | -0.009 |
| -0.770000000000085 | -0.57 | -0.044 | -0.009 |
| -0.765000000000085 | -0.568 | -0.044 | -0.009 |
| -0.760000000000085 | -0.566 | -0.043 | -0.009 |
| -0.755000000000085 | -0.564 | -0.043 | -0.009 |
| -0.750000000000085 | -0.562 | -0.043 | -0.009 |
| -0.745000000000085 | -0.56 | -0.043 | -0.009 |
| -0.740000000000085 | -0.558 | -0.042 | -0.009 |
| -0.735000000000085 | -0.556 | -0.042 | -0.009 |
| -0.730000000000085 | -0.553 | -0.042 | -0.009 |
| -0.725000000000085 | -0.551 | -0.042 | -0.009 |
| -0.720000000000085 | -0.549 | -0.042 | -0.009 |
| -0.715000000000085 | -0.547 | -0.041 | -0.009 |
| -0.710000000000085 | -0.545 | -0.041 | -0.008 |
| -0.705000000000085 | -0.543 | -0.041 | -0.008 |
| -0.700000000000085 | -0.54 | -0.041 | -0.008 |
| -0.695000000000085 | -0.538 | -0.04 | -0.008 |
| -0.690000000000085 | -0.536 | -0.04 | -0.008 |
| -0.685000000000085 | -0.533 | -0.04 | -0.008 |
| -0.680000000000085 | -0.531 | -0.04 | -0.008 |
| -0.675000000000085 | -0.529 | -0.039 | -0.008 |
| -0.670000000000085 | -0.526 | -0.039 | -0.008 |
| -0.665000000000085 | -0.524 | -0.039 | -0.008 |
| -0.660000000000085 | -0.522 | -0.039 | -0.008 |
| -0.655000000000085 | -0.519 | -0.038 | -0.008 |
| -0.650000000000085 | -0.517 | -0.038 | -0.008 |
| -0.645000000000085 | -0.514 | -0.038 | -0.008 |
| -0.640000000000085 | -0.512 | -0.037 | -0.008 |
| -0.635000000000085 | -0.509 | -0.037 | -0.008 |
| -0.630000000000085 | -0.507 | -0.037 | -0.008 |
| -0.625000000000085 | -0.504 | -0.037 | -0.008 |
| -0.620000000000085 | -0.501 | -0.036 | -0.007 |
| -0.615000000000085 | -0.499 | -0.036 | -0.007 |
| -0.610000000000085 | -0.496 | -0.036 | -0.007 |
| -0.605000000000085 | -0.493 | -0.036 | -0.007 |
| -0.600000000000085 | -0.491 | -0.035 | -0.007 |
| -0.595000000000085 | -0.488 | -0.035 | -0.007 |
| -0.590000000000085 | -0.485 | -0.035 | -0.007 |
| -0.585000000000085 | -0.483 | -0.035 | -0.007 |
| -0.580000000000085 | -0.48 | -0.034 | -0.007 |
| -0.575000000000085 | -0.477 | -0.034 | -0.007 |
| -0.570000000000085 | -0.474 | -0.034 | -0.007 |
| -0.565000000000085 | -0.471 | -0.034 | -0.007 |
| -0.560000000000085 | -0.468 | -0.033 | -0.007 |
| -0.555000000000085 | -0.465 | -0.033 | -0.007 |
| -0.550000000000085 | -0.463 | -0.033 | -0.007 |
| -0.545000000000085 | -0.46 | -0.032 | -0.007 |
| -0.540000000000085 | -0.457 | -0.032 | -0.007 |
| -0.535000000000085 | -0.454 | -0.032 | -0.006 |
| -0.530000000000085 | -0.451 | -0.032 | -0.006 |
| -0.525000000000085 | -0.448 | -0.031 | -0.006 |
| -0.520000000000085 | -0.444 | -0.031 | -0.006 |
| -0.515000000000085 | -0.441 | -0.031 | -0.006 |
| -0.510000000000085 | -0.438 | -0.031 | -0.006 |
| -0.505000000000085 | -0.435 | -0.03 | -0.006 |
| -0.500000000000085 | -0.432 | -0.03 | -0.006 |
| -0.495000000000085 | -0.429 | -0.03 | -0.006 |
| -0.490000000000085 | -0.425 | -0.029 | -0.006 |
| -0.485000000000085 | -0.422 | -0.029 | -0.006 |
| -0.480000000000085 | -0.419 | -0.029 | -0.006 |
| -0.475000000000085 | -0.416 | -0.029 | -0.006 |
| -0.470000000000085 | -0.412 | -0.028 | -0.006 |
| -0.465000000000085 | -0.409 | -0.028 | -0.006 |
| -0.460000000000085 | -0.405 | -0.028 | -0.006 |
| -0.455000000000085 | -0.402 | -0.027 | -0.006 |
| -0.450000000000085 | -0.399 | -0.027 | -0.005 |
| -0.445000000000085 | -0.395 | -0.027 | -0.005 |
| -0.440000000000085 | -0.392 | -0.027 | -0.005 |
| -0.435000000000085 | -0.388 | -0.026 | -0.005 |
| -0.430000000000085 | -0.384 | -0.026 | -0.005 |
| -0.425000000000085 | -0.381 | -0.026 | -0.005 |
| -0.420000000000085 | -0.377 | -0.026 | -0.005 |
| -0.415000000000085 | -0.374 | -0.025 | -0.005 |
| -0.410000000000085 | -0.37 | -0.025 | -0.005 |
| -0.405000000000085 | -0.366 | -0.025 | -0.005 |
| -0.400000000000085 | -0.363 | -0.024 | -0.005 |
| -0.395000000000085 | -0.359 | -0.024 | -0.005 |
| -0.390000000000085 | -0.355 | -0.024 | -0.005 |
| -0.385000000000085 | -0.351 | -0.023 | -0.005 |
| -0.380000000000085 | -0.348 | -0.023 | -0.005 |
| -0.375000000000085 | -0.344 | -0.023 | -0.005 |
| -0.370000000000085 | -0.34 | -0.023 | -0.005 |
| -0.365000000000085 | -0.336 | -0.022 | -0.004 |
| -0.360000000000085 | -0.332 | -0.022 | -0.004 |
| -0.355000000000085 | -0.328 | -0.022 | -0.004 |
| -0.350000000000085 | -0.324 | -0.021 | -0.004 |
| -0.345000000000085 | -0.32 | -0.021 | -0.004 |
| -0.340000000000085 | -0.316 | -0.021 | -0.004 |
| -0.335000000000085 | -0.312 | -0.021 | -0.004 |
| -0.330000000000085 | -0.308 | -0.02 | -0.004 |
| -0.325000000000085 | -0.304 | -0.02 | -0.004 |
| -0.320000000000085 | -0.3 | -0.02 | -0.004 |
| -0.315000000000085 | -0.296 | -0.019 | -0.004 |
| -0.310000000000085 | -0.292 | -0.019 | -0.004 |
| -0.305000000000085 | -0.288 | -0.019 | -0.004 |
| -0.300000000000085 | -0.283 | -0.018 | -0.004 |
| -0.295000000000085 | -0.279 | -0.018 | -0.004 |
| -0.290000000000085 | -0.275 | -0.018 | -0.004 |
| -0.285000000000085 | -0.271 | -0.018 | -0.003 |
| -0.280000000000085 | -0.266 | -0.017 | -0.003 |
| -0.275000000000085 | -0.262 | -0.017 | -0.003 |
| -0.270000000000085 | -0.258 | -0.017 | -0.003 |
| -0.265000000000085 | -0.253 | -0.016 | -0.003 |
| -0.260000000000085 | -0.249 | -0.016 | -0.003 |
| -0.255000000000085 | -0.245 | -0.016 | -0.003 |
| -0.250000000000085 | -0.24 | -0.015 | -0.003 |
| -0.245000000000085 | -0.236 | -0.015 | -0.003 |
| -0.240000000000085 | -0.231 | -0.015 | -0.003 |
| -0.235000000000085 | -0.227 | -0.015 | -0.003 |
| -0.230000000000085 | -0.222 | -0.014 | -0.003 |
| -0.225000000000085 | -0.218 | -0.014 | -0.003 |
| -0.220000000000085 | -0.213 | -0.014 | -0.003 |
| -0.215000000000085 | -0.209 | -0.013 | -0.003 |
| -0.210000000000085 | -0.204 | -0.013 | -0.003 |
| -0.205000000000085 | -0.199 | -0.013 | -0.003 |
| -0.200000000000085 | -0.195 | -0.012 | -0.002 |
| -0.195000000000085 | -0.19 | -0.012 | -0.002 |
| -0.190000000000085 | -0.186 | -0.012 | -0.002 |
| -0.185000000000085 | -0.181 | -0.011 | -0.002 |
| -0.180000000000085 | -0.176 | -0.011 | -0.002 |
| -0.175000000000085 | -0.172 | -0.011 | -0.002 |
| -0.170000000000085 | -0.167 | -0.011 | -0.002 |
| -0.165000000000085 | -0.162 | -0.01 | -0.002 |
| -0.160000000000085 | -0.157 | -0.01 | -0.002 |
| -0.155000000000084 | -0.153 | -0.01 | -0.002 |
| -0.150000000000084 | -0.148 | -0.009 | -0.002 |
| -0.145000000000084 | -0.143 | -0.009 | -0.002 |
| -0.140000000000084 | -0.138 | -0.009 | -0.002 |
| -0.135000000000084 | -0.133 | -0.008 | -0.002 |
| -0.130000000000084 | -0.129 | -0.008 | -0.002 |
| -0.125000000000084 | -0.124 | -0.008 | -0.002 |
| -0.120000000000084 | -0.119 | -0.007 | -0.001 |
| -0.115000000000084 | -0.114 | -0.007 | -0.001 |
| -0.110000000000084 | -0.109 | -0.007 | -0.001 |
| -0.105000000000084 | -0.104 | -0.007 | -0.001 |
| -0.100000000000084 | -0.099 | -0.006 | -0.001 |
| -0.0950000000000844 | -0.094 | -0.006 | -0.001 |
| -0.0900000000000844 | -0.09 | -0.006 | -0.001 |
| -0.0850000000000844 | -0.085 | -0.005 | -0.001 |
| -0.0800000000000844 | -0.08 | -0.005 | -0.001 |
| -0.0750000000000844 | -0.075 | -0.005 | -0.001 |
| -0.0700000000000844 | -0.07 | -0.004 | -0.001 |
| -0.0650000000000844 | -0.065 | -0.004 | -0.001 |
| -0.0600000000000844 | -0.06 | -0.004 | -0.001 |
| -0.0550000000000844 | -0.055 | -0.003 | -0.001 |
| -0.0500000000000844 | -0.05 | -0.003 | -0.001 |
| -0.0450000000000844 | -0.045 | -0.003 | -0.001 |
| -0.0400000000000844 | -0.04 | -0.002 | 0 |
| -0.0350000000000844 | -0.035 | -0.002 | 0 |
| -0.0300000000000844 | -0.03 | -0.002 | 0 |
| -0.0250000000000844 | -0.025 | -0.002 | 0 |
| -0.0200000000000844 | -0.02 | -0.001 | 0 |
| -0.0150000000000844 | -0.015 | -0.001 | 0 |
| -0.0100000000000844 | -0.01 | -0.001 | 0 |
| -0.00500000000008444 | -0.005 | 0 | 0 |
| -8.4444604087075e-14 | 0 | 0 | 0 |
| 0.00499999999991555 | 0.005 | 0 | 0 |
| 0.00999999999991555 | 0.01 | 0.001 | 0 |
| 0.0149999999999156 | 0.015 | 0.001 | 0 |
| 0.0199999999999156 | 0.02 | 0.001 | 0 |
| 0.0249999999999156 | 0.025 | 0.002 | 0 |
| 0.0299999999999156 | 0.03 | 0.002 | 0 |
| 0.0349999999999155 | 0.035 | 0.002 | 0 |
| 0.0399999999999155 | 0.04 | 0.002 | 0 |
| 0.0449999999999155 | 0.045 | 0.003 | 0.001 |
| 0.0499999999999155 | 0.05 | 0.003 | 0.001 |
| 0.0549999999999155 | 0.055 | 0.003 | 0.001 |
| 0.0599999999999155 | 0.06 | 0.004 | 0.001 |
| 0.0649999999999155 | 0.065 | 0.004 | 0.001 |
| 0.0699999999999155 | 0.07 | 0.004 | 0.001 |
| 0.0749999999999155 | 0.075 | 0.005 | 0.001 |
| 0.0799999999999155 | 0.08 | 0.005 | 0.001 |
| 0.0849999999999155 | 0.085 | 0.005 | 0.001 |
| 0.0899999999999155 | 0.09 | 0.006 | 0.001 |
| 0.0949999999999155 | 0.094 | 0.006 | 0.001 |
| 0.0999999999999155 | 0.099 | 0.006 | 0.001 |
| 0.104999999999916 | 0.104 | 0.007 | 0.001 |
| 0.109999999999916 | 0.109 | 0.007 | 0.001 |
| 0.114999999999916 | 0.114 | 0.007 | 0.001 |
| 0.119999999999916 | 0.119 | 0.007 | 0.001 |
| 0.124999999999916 | 0.124 | 0.008 | 0.002 |
| 0.129999999999916 | 0.129 | 0.008 | 0.002 |
| 0.134999999999916 | 0.133 | 0.008 | 0.002 |
| 0.139999999999916 | 0.138 | 0.009 | 0.002 |
| 0.144999999999916 | 0.143 | 0.009 | 0.002 |
| 0.149999999999916 | 0.148 | 0.009 | 0.002 |
| 0.154999999999916 | 0.153 | 0.01 | 0.002 |
| 0.159999999999916 | 0.157 | 0.01 | 0.002 |
| 0.164999999999916 | 0.162 | 0.01 | 0.002 |
| 0.169999999999916 | 0.167 | 0.011 | 0.002 |
| 0.174999999999916 | 0.172 | 0.011 | 0.002 |
| 0.179999999999916 | 0.176 | 0.011 | 0.002 |
| 0.184999999999916 | 0.181 | 0.011 | 0.002 |
| 0.189999999999916 | 0.186 | 0.012 | 0.002 |
| 0.194999999999916 | 0.19 | 0.012 | 0.002 |
| 0.199999999999916 | 0.195 | 0.012 | 0.002 |
| 0.204999999999916 | 0.199 | 0.013 | 0.003 |
| 0.209999999999916 | 0.204 | 0.013 | 0.003 |
| 0.214999999999916 | 0.209 | 0.013 | 0.003 |
| 0.219999999999916 | 0.213 | 0.014 | 0.003 |
| 0.224999999999916 | 0.218 | 0.014 | 0.003 |
| 0.229999999999916 | 0.222 | 0.014 | 0.003 |
| 0.234999999999916 | 0.227 | 0.015 | 0.003 |
| 0.239999999999916 | 0.231 | 0.015 | 0.003 |
| 0.244999999999916 | 0.236 | 0.015 | 0.003 |
| 0.249999999999916 | 0.24 | 0.015 | 0.003 |
| 0.254999999999916 | 0.245 | 0.016 | 0.003 |
| 0.259999999999916 | 0.249 | 0.016 | 0.003 |
| 0.264999999999916 | 0.253 | 0.016 | 0.003 |
| 0.269999999999916 | 0.258 | 0.017 | 0.003 |
| 0.274999999999916 | 0.262 | 0.017 | 0.003 |
| 0.279999999999916 | 0.266 | 0.017 | 0.003 |
| 0.284999999999916 | 0.271 | 0.018 | 0.003 |
| 0.289999999999916 | 0.275 | 0.018 | 0.004 |
| 0.294999999999916 | 0.279 | 0.018 | 0.004 |
| 0.299999999999916 | 0.283 | 0.018 | 0.004 |
| 0.304999999999916 | 0.288 | 0.019 | 0.004 |
| 0.309999999999916 | 0.292 | 0.019 | 0.004 |
| 0.314999999999916 | 0.296 | 0.019 | 0.004 |
| 0.319999999999916 | 0.3 | 0.02 | 0.004 |
| 0.324999999999916 | 0.304 | 0.02 | 0.004 |
| 0.329999999999916 | 0.308 | 0.02 | 0.004 |
| 0.334999999999916 | 0.312 | 0.021 | 0.004 |
| 0.339999999999916 | 0.316 | 0.021 | 0.004 |
| 0.344999999999916 | 0.32 | 0.021 | 0.004 |
| 0.349999999999916 | 0.324 | 0.021 | 0.004 |
| 0.354999999999916 | 0.328 | 0.022 | 0.004 |
| 0.359999999999916 | 0.332 | 0.022 | 0.004 |
| 0.364999999999916 | 0.336 | 0.022 | 0.004 |
| 0.369999999999916 | 0.34 | 0.023 | 0.005 |
| 0.374999999999916 | 0.344 | 0.023 | 0.005 |
| 0.379999999999916 | 0.348 | 0.023 | 0.005 |
| 0.384999999999916 | 0.351 | 0.023 | 0.005 |
| 0.389999999999916 | 0.355 | 0.024 | 0.005 |
| 0.394999999999916 | 0.359 | 0.024 | 0.005 |
| 0.399999999999916 | 0.363 | 0.024 | 0.005 |
| 0.404999999999916 | 0.366 | 0.025 | 0.005 |
| 0.409999999999916 | 0.37 | 0.025 | 0.005 |
| 0.414999999999916 | 0.374 | 0.025 | 0.005 |
| 0.419999999999916 | 0.377 | 0.026 | 0.005 |
| 0.424999999999916 | 0.381 | 0.026 | 0.005 |
| 0.429999999999916 | 0.384 | 0.026 | 0.005 |
| 0.434999999999916 | 0.388 | 0.026 | 0.005 |
| 0.439999999999916 | 0.392 | 0.027 | 0.005 |
| 0.444999999999916 | 0.395 | 0.027 | 0.005 |
| 0.449999999999916 | 0.399 | 0.027 | 0.005 |
| 0.454999999999916 | 0.402 | 0.027 | 0.006 |
| 0.459999999999916 | 0.405 | 0.028 | 0.006 |
| 0.464999999999916 | 0.409 | 0.028 | 0.006 |
| 0.469999999999916 | 0.412 | 0.028 | 0.006 |
| 0.474999999999916 | 0.416 | 0.029 | 0.006 |
| 0.479999999999916 | 0.419 | 0.029 | 0.006 |
| 0.484999999999916 | 0.422 | 0.029 | 0.006 |
| 0.489999999999916 | 0.425 | 0.029 | 0.006 |
| 0.494999999999916 | 0.429 | 0.03 | 0.006 |
| 0.499999999999916 | 0.432 | 0.03 | 0.006 |
| 0.504999999999916 | 0.435 | 0.03 | 0.006 |
| 0.509999999999916 | 0.438 | 0.031 | 0.006 |
| 0.514999999999916 | 0.441 | 0.031 | 0.006 |
| 0.519999999999916 | 0.444 | 0.031 | 0.006 |
| 0.524999999999916 | 0.448 | 0.031 | 0.006 |
| 0.529999999999916 | 0.451 | 0.032 | 0.006 |
| 0.534999999999916 | 0.454 | 0.032 | 0.006 |
| 0.539999999999916 | 0.457 | 0.032 | 0.007 |
| 0.544999999999916 | 0.46 | 0.032 | 0.007 |
| 0.549999999999916 | 0.463 | 0.033 | 0.007 |
| 0.554999999999916 | 0.465 | 0.033 | 0.007 |
| 0.559999999999916 | 0.468 | 0.033 | 0.007 |
| 0.564999999999916 | 0.471 | 0.034 | 0.007 |
| 0.569999999999916 | 0.474 | 0.034 | 0.007 |
| 0.574999999999916 | 0.477 | 0.034 | 0.007 |
| 0.579999999999916 | 0.48 | 0.034 | 0.007 |
| 0.584999999999916 | 0.483 | 0.035 | 0.007 |
| 0.589999999999916 | 0.485 | 0.035 | 0.007 |
| 0.594999999999916 | 0.488 | 0.035 | 0.007 |
| 0.599999999999916 | 0.491 | 0.035 | 0.007 |
| 0.604999999999916 | 0.493 | 0.036 | 0.007 |
| 0.609999999999916 | 0.496 | 0.036 | 0.007 |
| 0.614999999999916 | 0.499 | 0.036 | 0.007 |
| 0.619999999999916 | 0.501 | 0.036 | 0.007 |
| 0.624999999999916 | 0.504 | 0.037 | 0.008 |
| 0.629999999999916 | 0.507 | 0.037 | 0.008 |
| 0.634999999999916 | 0.509 | 0.037 | 0.008 |
| 0.639999999999916 | 0.512 | 0.037 | 0.008 |
| 0.644999999999916 | 0.514 | 0.038 | 0.008 |
| 0.649999999999916 | 0.517 | 0.038 | 0.008 |
| 0.654999999999916 | 0.519 | 0.038 | 0.008 |
| 0.659999999999916 | 0.522 | 0.039 | 0.008 |
| 0.664999999999916 | 0.524 | 0.039 | 0.008 |
| 0.669999999999916 | 0.526 | 0.039 | 0.008 |
| 0.674999999999916 | 0.529 | 0.039 | 0.008 |
| 0.679999999999916 | 0.531 | 0.04 | 0.008 |
| 0.684999999999916 | 0.533 | 0.04 | 0.008 |
| 0.689999999999916 | 0.536 | 0.04 | 0.008 |
| 0.694999999999916 | 0.538 | 0.04 | 0.008 |
| 0.699999999999916 | 0.54 | 0.041 | 0.008 |
| 0.704999999999916 | 0.543 | 0.041 | 0.008 |
| 0.709999999999916 | 0.545 | 0.041 | 0.008 |
| 0.714999999999916 | 0.547 | 0.041 | 0.009 |
| 0.719999999999916 | 0.549 | 0.042 | 0.009 |
| 0.724999999999916 | 0.551 | 0.042 | 0.009 |
| 0.729999999999916 | 0.553 | 0.042 | 0.009 |
| 0.734999999999916 | 0.556 | 0.042 | 0.009 |
| 0.739999999999916 | 0.558 | 0.042 | 0.009 |
| 0.744999999999916 | 0.56 | 0.043 | 0.009 |
| 0.749999999999916 | 0.562 | 0.043 | 0.009 |
| 0.754999999999916 | 0.564 | 0.043 | 0.009 |
| 0.759999999999916 | 0.566 | 0.043 | 0.009 |
| 0.764999999999916 | 0.568 | 0.044 | 0.009 |
| 0.769999999999916 | 0.57 | 0.044 | 0.009 |
| 0.774999999999916 | 0.572 | 0.044 | 0.009 |
| 0.779999999999916 | 0.574 | 0.044 | 0.009 |
| 0.784999999999916 | 0.576 | 0.045 | 0.009 |
| 0.789999999999916 | 0.578 | 0.045 | 0.009 |
| 0.794999999999916 | 0.579 | 0.045 | 0.009 |
| 0.799999999999916 | 0.581 | 0.045 | 0.009 |
| 0.804999999999916 | 0.583 | 0.046 | 0.009 |
| 0.809999999999916 | 0.585 | 0.046 | 0.01 |
| 0.814999999999916 | 0.587 | 0.046 | 0.01 |
| 0.819999999999916 | 0.589 | 0.046 | 0.01 |
| 0.824999999999916 | 0.59 | 0.046 | 0.01 |
| 0.829999999999916 | 0.592 | 0.047 | 0.01 |
| 0.834999999999916 | 0.594 | 0.047 | 0.01 |
| 0.839999999999916 | 0.596 | 0.047 | 0.01 |
| 0.844999999999916 | 0.597 | 0.047 | 0.01 |
| 0.849999999999916 | 0.599 | 0.048 | 0.01 |
| 0.854999999999916 | 0.601 | 0.048 | 0.01 |
| 0.859999999999916 | 0.602 | 0.048 | 0.01 |
| 0.864999999999916 | 0.604 | 0.048 | 0.01 |
| 0.869999999999916 | 0.606 | 0.049 | 0.01 |
| 0.874999999999916 | 0.607 | 0.049 | 0.01 |
| 0.879999999999916 | 0.609 | 0.049 | 0.01 |
| 0.884999999999916 | 0.61 | 0.049 | 0.01 |
| 0.889999999999916 | 0.612 | 0.049 | 0.01 |
| 0.894999999999916 | 0.613 | 0.05 | 0.01 |
| 0.899999999999916 | 0.615 | 0.05 | 0.01 |
| 0.904999999999916 | 0.617 | 0.05 | 0.011 |
| 0.909999999999916 | 0.618 | 0.05 | 0.011 |
| 0.914999999999916 | 0.62 | 0.05 | 0.011 |
| 0.919999999999916 | 0.621 | 0.051 | 0.011 |
| 0.924999999999916 | 0.622 | 0.051 | 0.011 |
| 0.929999999999916 | 0.624 | 0.051 | 0.011 |
| 0.934999999999916 | 0.625 | 0.051 | 0.011 |
| 0.939999999999916 | 0.627 | 0.052 | 0.011 |
| 0.944999999999916 | 0.628 | 0.052 | 0.011 |
| 0.949999999999916 | 0.63 | 0.052 | 0.011 |
| 0.954999999999916 | 0.631 | 0.052 | 0.011 |
| 0.959999999999916 | 0.632 | 0.052 | 0.011 |
| 0.964999999999916 | 0.634 | 0.053 | 0.011 |
| 0.969999999999916 | 0.635 | 0.053 | 0.011 |
| 0.974999999999916 | 0.636 | 0.053 | 0.011 |
| 0.979999999999916 | 0.638 | 0.053 | 0.011 |
| 0.984999999999916 | 0.639 | 0.053 | 0.011 |
| 0.989999999999916 | 0.64 | 0.054 | 0.011 |
| 0.994999999999916 | 0.641 | 0.054 | 0.011 |
| 0.999999999999916 | 0.643 | 0.054 | 0.012 |
| 1.004999999999916 | 0.644 | 0.054 | 0.012 |
| 1.009999999999916 | 0.645 | 0.054 | 0.012 |
| 1.014999999999916 | 0.646 | 0.055 | 0.012 |
| 1.019999999999916 | 0.648 | 0.055 | 0.012 |
| 1.024999999999916 | 0.649 | 0.055 | 0.012 |
| 1.029999999999916 | 0.65 | 0.055 | 0.012 |
| 1.034999999999916 | 0.651 | 0.055 | 0.012 |
| 1.039999999999915 | 0.652 | 0.056 | 0.012 |
| 1.044999999999915 | 0.653 | 0.056 | 0.012 |
| 1.049999999999915 | 0.655 | 0.056 | 0.012 |
| 1.054999999999915 | 0.656 | 0.056 | 0.012 |
| 1.059999999999915 | 0.657 | 0.056 | 0.012 |
| 1.064999999999915 | 0.658 | 0.057 | 0.012 |
| 1.069999999999915 | 0.659 | 0.057 | 0.012 |
| 1.074999999999915 | 0.66 | 0.057 | 0.012 |
| 1.079999999999915 | 0.661 | 0.057 | 0.012 |
| 1.084999999999914 | 0.662 | 0.057 | 0.012 |
| 1.089999999999914 | 0.663 | 0.057 | 0.012 |
| 1.094999999999914 | 0.664 | 0.058 | 0.012 |
| 1.099999999999914 | 0.665 | 0.058 | 0.012 |
| 1.104999999999914 | 0.666 | 0.058 | 0.013 |
| 1.109999999999914 | 0.667 | 0.058 | 0.013 |
| 1.114999999999914 | 0.668 | 0.058 | 0.013 |
| 1.119999999999914 | 0.669 | 0.059 | 0.013 |
| 1.124999999999914 | 0.67 | 0.059 | 0.013 |
| 1.129999999999914 | 0.671 | 0.059 | 0.013 |
| 1.134999999999913 | 0.672 | 0.059 | 0.013 |
| 1.139999999999913 | 0.673 | 0.059 | 0.013 |
| 1.144999999999913 | 0.674 | 0.059 | 0.013 |
| 1.149999999999913 | 0.675 | 0.06 | 0.013 |
| 1.154999999999913 | 0.676 | 0.06 | 0.013 |
| 1.159999999999913 | 0.677 | 0.06 | 0.013 |
| 1.164999999999913 | 0.678 | 0.06 | 0.013 |
| 1.169999999999913 | 0.679 | 0.06 | 0.013 |
| 1.174999999999913 | 0.68 | 0.06 | 0.013 |
| 1.179999999999912 | 0.681 | 0.061 | 0.013 |
| 1.184999999999912 | 0.681 | 0.061 | 0.013 |
| 1.189999999999912 | 0.682 | 0.061 | 0.013 |
| 1.194999999999912 | 0.683 | 0.061 | 0.013 |
| 1.199999999999912 | 0.684 | 0.061 | 0.013 |
| 1.204999999999912 | 0.685 | 0.062 | 0.013 |
| 1.209999999999912 | 0.686 | 0.062 | 0.014 |
| 1.214999999999912 | 0.686 | 0.062 | 0.014 |
| 1.219999999999912 | 0.687 | 0.062 | 0.014 |
| 1.224999999999911 | 0.688 | 0.062 | 0.014 |
| 1.229999999999911 | 0.689 | 0.062 | 0.014 |
| 1.234999999999911 | 0.69 | 0.063 | 0.014 |
| 1.239999999999911 | 0.69 | 0.063 | 0.014 |
| 1.244999999999911 | 0.691 | 0.063 | 0.014 |
| 1.249999999999911 | 0.692 | 0.063 | 0.014 |
| 1.254999999999911 | 0.693 | 0.063 | 0.014 |
| 1.259999999999911 | 0.693 | 0.063 | 0.014 |
| 1.264999999999911 | 0.694 | 0.063 | 0.014 |
| 1.269999999999911 | 0.695 | 0.064 | 0.014 |
| 1.27499999999991 | 0.696 | 0.064 | 0.014 |
| 1.27999999999991 | 0.696 | 0.064 | 0.014 |
| 1.28499999999991 | 0.697 | 0.064 | 0.014 |
| 1.28999999999991 | 0.698 | 0.064 | 0.014 |
| 1.29499999999991 | 0.698 | 0.064 | 0.014 |
| 1.29999999999991 | 0.699 | 0.065 | 0.014 |
| 1.30499999999991 | 0.7 | 0.065 | 0.014 |
| 1.30999999999991 | 0.701 | 0.065 | 0.014 |
| 1.31499999999991 | 0.701 | 0.065 | 0.014 |
| 1.319999999999909 | 0.702 | 0.065 | 0.015 |
| 1.324999999999909 | 0.703 | 0.065 | 0.015 |
| 1.329999999999909 | 0.703 | 0.065 | 0.015 |
| 1.334999999999909 | 0.704 | 0.066 | 0.015 |
| 1.339999999999909 | 0.705 | 0.066 | 0.015 |
| 1.344999999999909 | 0.705 | 0.066 | 0.015 |
| 1.349999999999909 | 0.706 | 0.066 | 0.015 |
| 1.354999999999909 | 0.706 | 0.066 | 0.015 |
| 1.359999999999909 | 0.707 | 0.066 | 0.015 |
| 1.364999999999908 | 0.708 | 0.067 | 0.015 |
| 1.369999999999908 | 0.708 | 0.067 | 0.015 |
| 1.374999999999908 | 0.709 | 0.067 | 0.015 |
| 1.379999999999908 | 0.709 | 0.067 | 0.015 |
| 1.384999999999908 | 0.71 | 0.067 | 0.015 |
| 1.389999999999908 | 0.711 | 0.067 | 0.015 |
| 1.394999999999908 | 0.711 | 0.067 | 0.015 |
| 1.399999999999908 | 0.712 | 0.068 | 0.015 |
| 1.404999999999908 | 0.712 | 0.068 | 0.015 |
| 1.409999999999908 | 0.713 | 0.068 | 0.015 |
| 1.414999999999907 | 0.713 | 0.068 | 0.015 |
| 1.419999999999907 | 0.714 | 0.068 | 0.015 |
| 1.424999999999907 | 0.715 | 0.068 | 0.015 |
| 1.429999999999907 | 0.715 | 0.068 | 0.015 |
| 1.434999999999907 | 0.716 | 0.069 | 0.015 |
| 1.439999999999907 | 0.716 | 0.069 | 0.016 |
| 1.444999999999907 | 0.717 | 0.069 | 0.016 |
| 1.449999999999907 | 0.717 | 0.069 | 0.016 |
| 1.454999999999907 | 0.718 | 0.069 | 0.016 |
| 1.459999999999906 | 0.718 | 0.069 | 0.016 |
| 1.464999999999906 | 0.719 | 0.069 | 0.016 |
| 1.469999999999906 | 0.719 | 0.069 | 0.016 |
| 1.474999999999906 | 0.72 | 0.07 | 0.016 |
| 1.479999999999906 | 0.72 | 0.07 | 0.016 |
| 1.484999999999906 | 0.721 | 0.07 | 0.016 |
| 1.489999999999906 | 0.721 | 0.07 | 0.016 |
| 1.494999999999906 | 0.722 | 0.07 | 0.016 |
| 1.499999999999906 | 0.722 | 0.07 | 0.016 |
| 1.504999999999906 | 0.723 | 0.07 | 0.016 |
| 1.509999999999905 | 0.723 | 0.07 | 0.016 |
| 1.514999999999905 | 0.724 | 0.071 | 0.016 |
| 1.519999999999905 | 0.724 | 0.071 | 0.016 |
| 1.524999999999905 | 0.724 | 0.071 | 0.016 |
| 1.529999999999905 | 0.725 | 0.071 | 0.016 |
| 1.534999999999905 | 0.725 | 0.071 | 0.016 |
| 1.539999999999905 | 0.726 | 0.071 | 0.016 |
| 1.544999999999905 | 0.726 | 0.071 | 0.016 |
| 1.549999999999905 | 0.727 | 0.071 | 0.016 |
| 1.554999999999904 | 0.727 | 0.072 | 0.016 |
| 1.559999999999904 | 0.728 | 0.072 | 0.016 |
| 1.564999999999904 | 0.728 | 0.072 | 0.016 |
| 1.569999999999904 | 0.728 | 0.072 | 0.017 |
| 1.574999999999904 | 0.729 | 0.072 | 0.017 |
| 1.579999999999904 | 0.729 | 0.072 | 0.017 |
| 1.584999999999904 | 0.73 | 0.072 | 0.017 |
| 1.589999999999904 | 0.73 | 0.072 | 0.017 |
| 1.594999999999904 | 0.73 | 0.073 | 0.017 |
| 1.599999999999903 | 0.731 | 0.073 | 0.017 |
| 1.604999999999903 | 0.731 | 0.073 | 0.017 |
| 1.609999999999903 | 0.732 | 0.073 | 0.017 |
| 1.614999999999903 | 0.732 | 0.073 | 0.017 |
| 1.619999999999903 | 0.732 | 0.073 | 0.017 |
| 1.624999999999903 | 0.733 | 0.073 | 0.017 |
| 1.629999999999903 | 0.733 | 0.073 | 0.017 |
| 1.634999999999903 | 0.733 | 0.073 | 0.017 |
| 1.639999999999903 | 0.734 | 0.074 | 0.017 |
| 1.644999999999902 | 0.734 | 0.074 | 0.017 |
| 1.649999999999902 | 0.735 | 0.074 | 0.017 |
| 1.654999999999902 | 0.735 | 0.074 | 0.017 |
| 1.659999999999902 | 0.735 | 0.074 | 0.017 |
| 1.664999999999902 | 0.736 | 0.074 | 0.017 |
| 1.669999999999902 | 0.736 | 0.074 | 0.017 |
| 1.674999999999902 | 0.736 | 0.074 | 0.017 |
| 1.679999999999902 | 0.737 | 0.074 | 0.017 |
| 1.684999999999902 | 0.737 | 0.075 | 0.017 |
| 1.689999999999901 | 0.737 | 0.075 | 0.017 |
| 1.694999999999901 | 0.738 | 0.075 | 0.017 |
| 1.699999999999901 | 0.738 | 0.075 | 0.017 |
| 1.704999999999901 | 0.738 | 0.075 | 0.018 |
| 1.709999999999901 | 0.739 | 0.075 | 0.018 |
| 1.714999999999901 | 0.739 | 0.075 | 0.018 |
| 1.719999999999901 | 0.739 | 0.075 | 0.018 |
| 1.724999999999901 | 0.74 | 0.075 | 0.018 |
| 1.729999999999901 | 0.74 | 0.075 | 0.018 |
| 1.734999999999901 | 0.74 | 0.076 | 0.018 |
| 1.7399999999999 | 0.741 | 0.076 | 0.018 |
| 1.7449999999999 | 0.741 | 0.076 | 0.018 |
| 1.7499999999999 | 0.741 | 0.076 | 0.018 |
| 1.7549999999999 | 0.742 | 0.076 | 0.018 |
| 1.7599999999999 | 0.742 | 0.076 | 0.018 |
| 1.7649999999999 | 0.742 | 0.076 | 0.018 |
| 1.7699999999999 | 0.742 | 0.076 | 0.018 |
| 1.7749999999999 | 0.743 | 0.076 | 0.018 |
| 1.7799999999999 | 0.743 | 0.076 | 0.018 |
| 1.784999999999899 | 0.743 | 0.077 | 0.018 |
| 1.789999999999899 | 0.744 | 0.077 | 0.018 |
| 1.794999999999899 | 0.744 | 0.077 | 0.018 |
| 1.799999999999899 | 0.744 | 0.077 | 0.018 |
| 1.804999999999899 | 0.744 | 0.077 | 0.018 |
| 1.809999999999899 | 0.745 | 0.077 | 0.018 |
| 1.814999999999899 | 0.745 | 0.077 | 0.018 |
| 1.819999999999899 | 0.745 | 0.077 | 0.018 |
| 1.824999999999899 | 0.745 | 0.077 | 0.018 |
| 1.829999999999899 | 0.746 | 0.077 | 0.018 |
| 1.834999999999898 | 0.746 | 0.078 | 0.018 |
| 1.839999999999898 | 0.746 | 0.078 | 0.018 |
| 1.844999999999898 | 0.747 | 0.078 | 0.018 |
| 1.849999999999898 | 0.747 | 0.078 | 0.019 |
| 1.854999999999898 | 0.747 | 0.078 | 0.019 |
| 1.859999999999898 | 0.747 | 0.078 | 0.019 |
| 1.864999999999898 | 0.748 | 0.078 | 0.019 |
| 1.869999999999898 | 0.748 | 0.078 | 0.019 |
| 1.874999999999898 | 0.748 | 0.078 | 0.019 |
| 1.879999999999897 | 0.748 | 0.078 | 0.019 |
| 1.884999999999897 | 0.749 | 0.078 | 0.019 |
| 1.889999999999897 | 0.749 | 0.079 | 0.019 |
| 1.894999999999897 | 0.749 | 0.079 | 0.019 |
| 1.899999999999897 | 0.749 | 0.079 | 0.019 |
| 1.904999999999897 | 0.749 | 0.079 | 0.019 |
| 1.909999999999897 | 0.75 | 0.079 | 0.019 |
| 1.914999999999897 | 0.75 | 0.079 | 0.019 |
| 1.919999999999897 | 0.75 | 0.079 | 0.019 |
| 1.924999999999897 | 0.75 | 0.079 | 0.019 |
| 1.929999999999896 | 0.751 | 0.079 | 0.019 |
| 1.934999999999896 | 0.751 | 0.079 | 0.019 |
| 1.939999999999896 | 0.751 | 0.079 | 0.019 |
| 1.944999999999896 | 0.751 | 0.079 | 0.019 |
| 1.949999999999896 | 0.751 | 0.08 | 0.019 |
| 1.954999999999896 | 0.752 | 0.08 | 0.019 |
| 1.959999999999896 | 0.752 | 0.08 | 0.019 |
| 1.964999999999896 | 0.752 | 0.08 | 0.019 |
| 1.969999999999896 | 0.752 | 0.08 | 0.019 |
| 1.974999999999895 | 0.753 | 0.08 | 0.019 |
| 1.979999999999895 | 0.753 | 0.08 | 0.019 |
| 1.984999999999895 | 0.753 | 0.08 | 0.019 |
| 1.989999999999895 | 0.753 | 0.08 | 0.019 |
| 1.994999999999895 | 0.753 | 0.08 | 0.019 |
| 1.999999999999895 | 0.754 | 0.08 | 0.019 |
| 2.004999999999895 | 0.754 | 0.08 | 0.019 |
| 2.009999999999895 | 0.754 | 0.08 | 0.019 |
| 2.014999999999895 | 0.754 | 0.081 | 0.02 |
| 2.019999999999895 | 0.754 | 0.081 | 0.02 |
| 2.024999999999895 | 0.755 | 0.081 | 0.02 |
| 2.029999999999895 | 0.755 | 0.081 | 0.02 |
| 2.034999999999894 | 0.755 | 0.081 | 0.02 |
| 2.039999999999894 | 0.755 | 0.081 | 0.02 |
| 2.044999999999894 | 0.755 | 0.081 | 0.02 |
| 2.049999999999894 | 0.755 | 0.081 | 0.02 |
| 2.054999999999894 | 0.756 | 0.081 | 0.02 |
| 2.059999999999894 | 0.756 | 0.081 | 0.02 |
| 2.064999999999894 | 0.756 | 0.081 | 0.02 |
| 2.069999999999894 | 0.756 | 0.081 | 0.02 |
| 2.074999999999894 | 0.756 | 0.081 | 0.02 |
| 2.079999999999893 | 0.757 | 0.082 | 0.02 |
| 2.084999999999893 | 0.757 | 0.082 | 0.02 |
| 2.089999999999893 | 0.757 | 0.082 | 0.02 |
| 2.094999999999893 | 0.757 | 0.082 | 0.02 |
| 2.099999999999893 | 0.757 | 0.082 | 0.02 |
| 2.104999999999893 | 0.757 | 0.082 | 0.02 |
| 2.109999999999893 | 0.758 | 0.082 | 0.02 |
| 2.114999999999893 | 0.758 | 0.082 | 0.02 |
| 2.119999999999893 | 0.758 | 0.082 | 0.02 |
| 2.124999999999893 | 0.758 | 0.082 | 0.02 |
| 2.129999999999892 | 0.758 | 0.082 | 0.02 |
| 2.134999999999892 | 0.758 | 0.082 | 0.02 |
| 2.139999999999892 | 0.759 | 0.082 | 0.02 |
| 2.144999999999892 | 0.759 | 0.082 | 0.02 |
| 2.149999999999892 | 0.759 | 0.083 | 0.02 |
| 2.154999999999892 | 0.759 | 0.083 | 0.02 |
| 2.159999999999892 | 0.759 | 0.083 | 0.02 |
| 2.164999999999892 | 0.759 | 0.083 | 0.02 |
| 2.169999999999892 | 0.76 | 0.083 | 0.02 |
| 2.174999999999891 | 0.76 | 0.083 | 0.02 |
| 2.179999999999891 | 0.76 | 0.083 | 0.02 |
| 2.184999999999891 | 0.76 | 0.083 | 0.02 |
| 2.189999999999891 | 0.76 | 0.083 | 0.02 |
| 2.194999999999891 | 0.76 | 0.083 | 0.021 |
| 2.199999999999891 | 0.76 | 0.083 | 0.021 |
| 2.204999999999891 | 0.761 | 0.083 | 0.021 |
| 2.209999999999891 | 0.761 | 0.083 | 0.021 |
| 2.214999999999891 | 0.761 | 0.083 | 0.021 |
| 2.21999999999989 | 0.761 | 0.083 | 0.021 |
| 2.22499999999989 | 0.761 | 0.083 | 0.021 |
| 2.22999999999989 | 0.761 | 0.084 | 0.021 |
| 2.23499999999989 | 0.761 | 0.084 | 0.021 |
| 2.23999999999989 | 0.762 | 0.084 | 0.021 |
| 2.24499999999989 | 0.762 | 0.084 | 0.021 |
| 2.24999999999989 | 0.762 | 0.084 | 0.021 |
| 2.25499999999989 | 0.762 | 0.084 | 0.021 |
| 2.25999999999989 | 0.762 | 0.084 | 0.021 |
| 2.26499999999989 | 0.762 | 0.084 | 0.021 |
| 2.269999999999889 | 0.762 | 0.084 | 0.021 |
| 2.274999999999889 | 0.763 | 0.084 | 0.021 |
| 2.279999999999889 | 0.763 | 0.084 | 0.021 |
| 2.284999999999889 | 0.763 | 0.084 | 0.021 |
| 2.289999999999889 | 0.763 | 0.084 | 0.021 |
| 2.294999999999889 | 0.763 | 0.084 | 0.021 |
| 2.299999999999889 | 0.763 | 0.084 | 0.021 |
| 2.304999999999889 | 0.763 | 0.084 | 0.021 |
| 2.309999999999889 | 0.763 | 0.085 | 0.021 |
| 2.314999999999888 | 0.764 | 0.085 | 0.021 |
| 2.319999999999888 | 0.764 | 0.085 | 0.021 |
| 2.324999999999888 | 0.764 | 0.085 | 0.021 |
| 2.329999999999888 | 0.764 | 0.085 | 0.021 |
| 2.334999999999888 | 0.764 | 0.085 | 0.021 |
| 2.339999999999888 | 0.764 | 0.085 | 0.021 |
| 2.344999999999888 | 0.764 | 0.085 | 0.021 |
| 2.349999999999888 | 0.764 | 0.085 | 0.021 |
| 2.354999999999888 | 0.765 | 0.085 | 0.021 |
| 2.359999999999887 | 0.765 | 0.085 | 0.021 |
| 2.364999999999887 | 0.765 | 0.085 | 0.021 |
| 2.369999999999887 | 0.765 | 0.085 | 0.021 |
| 2.374999999999887 | 0.765 | 0.085 | 0.021 |
| 2.379999999999887 | 0.765 | 0.085 | 0.021 |
| 2.384999999999887 | 0.765 | 0.085 | 0.021 |
| 2.389999999999887 | 0.765 | 0.085 | 0.021 |
| 2.394999999999887 | 0.765 | 0.085 | 0.022 |
| 2.399999999999887 | 0.766 | 0.085 | 0.022 |
| 2.404999999999887 | 0.766 | 0.086 | 0.022 |
| 2.409999999999886 | 0.766 | 0.086 | 0.022 |
| 2.414999999999886 | 0.766 | 0.086 | 0.022 |
| 2.419999999999886 | 0.766 | 0.086 | 0.022 |
| 2.424999999999886 | 0.766 | 0.086 | 0.022 |
| 2.429999999999886 | 0.766 | 0.086 | 0.022 |
| 2.434999999999886 | 0.766 | 0.086 | 0.022 |
| 2.439999999999886 | 0.766 | 0.086 | 0.022 |
| 2.444999999999886 | 0.766 | 0.086 | 0.022 |
| 2.449999999999886 | 0.767 | 0.086 | 0.022 |
| 2.454999999999885 | 0.767 | 0.086 | 0.022 |
| 2.459999999999885 | 0.767 | 0.086 | 0.022 |
| 2.464999999999885 | 0.767 | 0.086 | 0.022 |
| 2.469999999999885 | 0.767 | 0.086 | 0.022 |
| 2.474999999999885 | 0.767 | 0.086 | 0.022 |
| 2.479999999999885 | 0.767 | 0.086 | 0.022 |
| 2.484999999999885 | 0.767 | 0.086 | 0.022 |
| 2.489999999999885 | 0.767 | 0.086 | 0.022 |
| 2.494999999999885 | 0.767 | 0.086 | 0.022 |
| 2.499999999999884 | 0.768 | 0.086 | 0.022 |
| 2.504999999999884 | 0.768 | 0.087 | 0.022 |
| 2.509999999999884 | 0.768 | 0.087 | 0.022 |
| 2.514999999999884 | 0.768 | 0.087 | 0.022 |
| 2.519999999999884 | 0.768 | 0.087 | 0.022 |
| 2.524999999999884 | 0.768 | 0.087 | 0.022 |
| 2.529999999999884 | 0.768 | 0.087 | 0.022 |
| 2.534999999999884 | 0.768 | 0.087 | 0.022 |
| 2.539999999999884 | 0.768 | 0.087 | 0.022 |
| 2.544999999999884 | 0.768 | 0.087 | 0.022 |
| 2.549999999999883 | 0.768 | 0.087 | 0.022 |
| 2.554999999999883 | 0.769 | 0.087 | 0.022 |
| 2.559999999999883 | 0.769 | 0.087 | 0.022 |
| 2.564999999999883 | 0.769 | 0.087 | 0.022 |
| 2.569999999999883 | 0.769 | 0.087 | 0.022 |
| 2.574999999999883 | 0.769 | 0.087 | 0.022 |
| 2.579999999999883 | 0.769 | 0.087 | 0.022 |
| 2.584999999999883 | 0.769 | 0.087 | 0.022 |
| 2.589999999999883 | 0.769 | 0.087 | 0.022 |
| 2.594999999999882 | 0.769 | 0.087 | 0.022 |
| 2.599999999999882 | 0.769 | 0.087 | 0.022 |
| 2.604999999999882 | 0.769 | 0.087 | 0.022 |
| 2.609999999999882 | 0.77 | 0.087 | 0.022 |
| 2.614999999999882 | 0.77 | 0.088 | 0.022 |
| 2.619999999999882 | 0.77 | 0.088 | 0.022 |
| 2.624999999999882 | 0.77 | 0.088 | 0.022 |
| 2.629999999999882 | 0.77 | 0.088 | 0.023 |
| 2.634999999999882 | 0.77 | 0.088 | 0.023 |
| 2.639999999999881 | 0.77 | 0.088 | 0.023 |
| 2.644999999999881 | 0.77 | 0.088 | 0.023 |
| 2.649999999999881 | 0.77 | 0.088 | 0.023 |
| 2.654999999999881 | 0.77 | 0.088 | 0.023 |
| 2.659999999999881 | 0.77 | 0.088 | 0.023 |
| 2.664999999999881 | 0.77 | 0.088 | 0.023 |
| 2.669999999999881 | 0.77 | 0.088 | 0.023 |
| 2.674999999999881 | 0.771 | 0.088 | 0.023 |
| 2.679999999999881 | 0.771 | 0.088 | 0.023 |
| 2.68499999999988 | 0.771 | 0.088 | 0.023 |
| 2.68999999999988 | 0.771 | 0.088 | 0.023 |
| 2.69499999999988 | 0.771 | 0.088 | 0.023 |
| 2.69999999999988 | 0.771 | 0.088 | 0.023 |
| 2.70499999999988 | 0.771 | 0.088 | 0.023 |
| 2.70999999999988 | 0.771 | 0.088 | 0.023 |
| 2.71499999999988 | 0.771 | 0.088 | 0.023 |
| 2.71999999999988 | 0.771 | 0.088 | 0.023 |
| 2.72499999999988 | 0.771 | 0.088 | 0.023 |
| 2.72999999999988 | 0.771 | 0.088 | 0.023 |
| 2.734999999999879 | 0.771 | 0.088 | 0.023 |
| 2.739999999999879 | 0.771 | 0.089 | 0.023 |
| 2.744999999999879 | 0.772 | 0.089 | 0.023 |
| 2.749999999999879 | 0.772 | 0.089 | 0.023 |
| 2.754999999999879 | 0.772 | 0.089 | 0.023 |
| 2.759999999999879 | 0.772 | 0.089 | 0.023 |
| 2.764999999999879 | 0.772 | 0.089 | 0.023 |
| 2.769999999999879 | 0.772 | 0.089 | 0.023 |
| 2.774999999999879 | 0.772 | 0.089 | 0.023 |
| 2.779999999999878 | 0.772 | 0.089 | 0.023 |
| 2.784999999999878 | 0.772 | 0.089 | 0.023 |
| 2.789999999999878 | 0.772 | 0.089 | 0.023 |
| 2.794999999999878 | 0.772 | 0.089 | 0.023 |
| 2.799999999999878 | 0.772 | 0.089 | 0.023 |
| 2.804999999999878 | 0.772 | 0.089 | 0.023 |
| 2.809999999999878 | 0.772 | 0.089 | 0.023 |
| 2.814999999999878 | 0.772 | 0.089 | 0.023 |
| 2.819999999999878 | 0.773 | 0.089 | 0.023 |
| 2.824999999999878 | 0.773 | 0.089 | 0.023 |
| 2.829999999999877 | 0.773 | 0.089 | 0.023 |
| 2.834999999999877 | 0.773 | 0.089 | 0.023 |
| 2.839999999999877 | 0.773 | 0.089 | 0.023 |
| 2.844999999999877 | 0.773 | 0.089 | 0.023 |
| 2.849999999999877 | 0.773 | 0.089 | 0.023 |
| 2.854999999999877 | 0.773 | 0.089 | 0.023 |
| 2.859999999999877 | 0.773 | 0.089 | 0.023 |
| 2.864999999999877 | 0.773 | 0.089 | 0.023 |
| 2.869999999999877 | 0.773 | 0.089 | 0.023 |
| 2.874999999999876 | 0.773 | 0.089 | 0.023 |
| 2.879999999999876 | 0.773 | 0.09 | 0.023 |
| 2.884999999999876 | 0.773 | 0.09 | 0.023 |
| 2.889999999999876 | 0.773 | 0.09 | 0.023 |
| 2.894999999999876 | 0.773 | 0.09 | 0.023 |
| 2.899999999999876 | 0.773 | 0.09 | 0.023 |
| 2.904999999999876 | 0.774 | 0.09 | 0.024 |
| 2.909999999999876 | 0.774 | 0.09 | 0.024 |
| 2.914999999999876 | 0.774 | 0.09 | 0.024 |
| 2.919999999999876 | 0.774 | 0.09 | 0.024 |
| 2.924999999999875 | 0.774 | 0.09 | 0.024 |
| 2.929999999999875 | 0.774 | 0.09 | 0.024 |
| 2.934999999999875 | 0.774 | 0.09 | 0.024 |
| 2.939999999999875 | 0.774 | 0.09 | 0.024 |
| 2.944999999999875 | 0.774 | 0.09 | 0.024 |
| 2.949999999999875 | 0.774 | 0.09 | 0.024 |
| 2.954999999999875 | 0.774 | 0.09 | 0.024 |
| 2.959999999999875 | 0.774 | 0.09 | 0.024 |
| 2.964999999999875 | 0.774 | 0.09 | 0.024 |
| 2.969999999999874 | 0.774 | 0.09 | 0.024 |
| 2.974999999999874 | 0.774 | 0.09 | 0.024 |
| 2.979999999999874 | 0.774 | 0.09 | 0.024 |
| 2.984999999999874 | 0.774 | 0.09 | 0.024 |
| 2.989999999999874 | 0.774 | 0.09 | 0.024 |
| 2.994999999999874 | 0.774 | 0.09 | 0.024 |
| 2.999999999999874 | 0.775 | 0.09 | 0.024 |
| 3.004999999999874 | 0.775 | 0.09 | 0.024 |
| 3.009999999999874 | 0.775 | 0.09 | 0.024 |
| 3.014999999999874 | 0.775 | 0.09 | 0.024 |
| 3.019999999999873 | 0.775 | 0.09 | 0.024 |
| 3.024999999999873 | 0.775 | 0.09 | 0.024 |
| 3.029999999999873 | 0.775 | 0.09 | 0.024 |
| 3.034999999999873 | 0.775 | 0.09 | 0.024 |
| 3.039999999999873 | 0.775 | 0.091 | 0.024 |
| 3.044999999999873 | 0.775 | 0.091 | 0.024 |
| 3.049999999999873 | 0.775 | 0.091 | 0.024 |
| 3.054999999999873 | 0.775 | 0.091 | 0.024 |
| 3.059999999999873 | 0.775 | 0.091 | 0.024 |
| 3.064999999999872 | 0.775 | 0.091 | 0.024 |
| 3.069999999999872 | 0.775 | 0.091 | 0.024 |
| 3.074999999999872 | 0.775 | 0.091 | 0.024 |
| 3.079999999999872 | 0.775 | 0.091 | 0.024 |
| 3.084999999999872 | 0.775 | 0.091 | 0.024 |
| 3.089999999999872 | 0.775 | 0.091 | 0.024 |
| 3.094999999999872 | 0.775 | 0.091 | 0.024 |
| 3.099999999999872 | 0.775 | 0.091 | 0.024 |
| 3.104999999999872 | 0.776 | 0.091 | 0.024 |
| 3.109999999999872 | 0.776 | 0.091 | 0.024 |
| 3.114999999999871 | 0.776 | 0.091 | 0.024 |
| 3.119999999999871 | 0.776 | 0.091 | 0.024 |
| 3.124999999999871 | 0.776 | 0.091 | 0.024 |
| 3.129999999999871 | 0.776 | 0.091 | 0.024 |
| 3.134999999999871 | 0.776 | 0.091 | 0.024 |
| 3.139999999999871 | 0.776 | 0.091 | 0.024 |
| 3.144999999999871 | 0.776 | 0.091 | 0.024 |
| 3.149999999999871 | 0.776 | 0.091 | 0.024 |
| 3.154999999999871 | 0.776 | 0.091 | 0.024 |
| 3.15999999999987 | 0.776 | 0.091 | 0.024 |
| 3.16499999999987 | 0.776 | 0.091 | 0.024 |
| 3.16999999999987 | 0.776 | 0.091 | 0.024 |
| 3.17499999999987 | 0.776 | 0.091 | 0.024 |
| 3.17999999999987 | 0.776 | 0.091 | 0.024 |
| 3.18499999999987 | 0.776 | 0.091 | 0.024 |
| 3.18999999999987 | 0.776 | 0.091 | 0.024 |
| 3.19499999999987 | 0.776 | 0.091 | 0.024 |
| 3.19999999999987 | 0.776 | 0.091 | 0.024 |
| 3.204999999999869 | 0.776 | 0.091 | 0.024 |
| 3.209999999999869 | 0.776 | 0.091 | 0.024 |
| 3.214999999999869 | 0.776 | 0.091 | 0.024 |
| 3.219999999999869 | 0.776 | 0.091 | 0.024 |
| 3.224999999999869 | 0.776 | 0.091 | 0.024 |
| 3.229999999999869 | 0.777 | 0.091 | 0.024 |
| 3.234999999999869 | 0.777 | 0.092 | 0.024 |
| 3.239999999999869 | 0.777 | 0.092 | 0.024 |
| 3.244999999999869 | 0.777 | 0.092 | 0.025 |
| 3.249999999999869 | 0.777 | 0.092 | 0.025 |
| 3.254999999999868 | 0.777 | 0.092 | 0.025 |
| 3.259999999999868 | 0.777 | 0.092 | 0.025 |
| 3.264999999999868 | 0.777 | 0.092 | 0.025 |
| 3.269999999999868 | 0.777 | 0.092 | 0.025 |
| 3.274999999999868 | 0.777 | 0.092 | 0.025 |
| 3.279999999999868 | 0.777 | 0.092 | 0.025 |
| 3.284999999999868 | 0.777 | 0.092 | 0.025 |
| 3.289999999999868 | 0.777 | 0.092 | 0.025 |
| 3.294999999999868 | 0.777 | 0.092 | 0.025 |
| 3.299999999999867 | 0.777 | 0.092 | 0.025 |
| 3.304999999999867 | 0.777 | 0.092 | 0.025 |
| 3.309999999999867 | 0.777 | 0.092 | 0.025 |
| 3.314999999999867 | 0.777 | 0.092 | 0.025 |
| 3.319999999999867 | 0.777 | 0.092 | 0.025 |
| 3.324999999999867 | 0.777 | 0.092 | 0.025 |
| 3.329999999999867 | 0.777 | 0.092 | 0.025 |
| 3.334999999999867 | 0.777 | 0.092 | 0.025 |
| 3.339999999999867 | 0.777 | 0.092 | 0.025 |
| 3.344999999999866 | 0.777 | 0.092 | 0.025 |
| 3.349999999999866 | 0.777 | 0.092 | 0.025 |
| 3.354999999999866 | 0.777 | 0.092 | 0.025 |
| 3.359999999999866 | 0.777 | 0.092 | 0.025 |
| 3.364999999999866 | 0.777 | 0.092 | 0.025 |
| 3.369999999999866 | 0.778 | 0.092 | 0.025 |
| 3.374999999999866 | 0.778 | 0.092 | 0.025 |
| 3.379999999999866 | 0.778 | 0.092 | 0.025 |
| 3.384999999999866 | 0.778 | 0.092 | 0.025 |
| 3.389999999999866 | 0.778 | 0.092 | 0.025 |
| 3.394999999999865 | 0.778 | 0.092 | 0.025 |
| 3.399999999999865 | 0.778 | 0.092 | 0.025 |
| 3.404999999999865 | 0.778 | 0.092 | 0.025 |
| 3.409999999999865 | 0.778 | 0.092 | 0.025 |
| 3.414999999999865 | 0.778 | 0.092 | 0.025 |
| 3.419999999999865 | 0.778 | 0.092 | 0.025 |
| 3.424999999999865 | 0.778 | 0.092 | 0.025 |
| 3.429999999999865 | 0.778 | 0.092 | 0.025 |
| 3.434999999999865 | 0.778 | 0.092 | 0.025 |
| 3.439999999999864 | 0.778 | 0.092 | 0.025 |
| 3.444999999999864 | 0.778 | 0.092 | 0.025 |
| 3.449999999999864 | 0.778 | 0.092 | 0.025 |
| 3.454999999999864 | 0.778 | 0.092 | 0.025 |
| 3.459999999999864 | 0.778 | 0.092 | 0.025 |
| 3.464999999999864 | 0.778 | 0.093 | 0.025 |
| 3.469999999999864 | 0.778 | 0.093 | 0.025 |
| 3.474999999999864 | 0.778 | 0.093 | 0.025 |
| 3.479999999999864 | 0.778 | 0.093 | 0.025 |
| 3.484999999999864 | 0.778 | 0.093 | 0.025 |
| 3.489999999999863 | 0.778 | 0.093 | 0.025 |
| 3.494999999999863 | 0.778 | 0.093 | 0.025 |
| 3.499999999999863 | 0.778 | 0.093 | 0.025 |
| 3.504999999999863 | 0.778 | 0.093 | 0.025 |
| 3.509999999999863 | 0.778 | 0.093 | 0.025 |
| 3.514999999999863 | 0.778 | 0.093 | 0.025 |
| 3.519999999999863 | 0.778 | 0.093 | 0.025 |
| 3.524999999999863 | 0.778 | 0.093 | 0.025 |
| 3.529999999999863 | 0.778 | 0.093 | 0.025 |
| 3.534999999999862 | 0.779 | 0.093 | 0.025 |
| 3.539999999999862 | 0.779 | 0.093 | 0.025 |
| 3.544999999999862 | 0.779 | 0.093 | 0.025 |
| 3.549999999999862 | 0.779 | 0.093 | 0.025 |
| 3.554999999999862 | 0.779 | 0.093 | 0.025 |
| 3.559999999999862 | 0.779 | 0.093 | 0.025 |
| 3.564999999999862 | 0.779 | 0.093 | 0.025 |
| 3.569999999999862 | 0.779 | 0.093 | 0.025 |
| 3.574999999999862 | 0.779 | 0.093 | 0.025 |
| 3.579999999999862 | 0.779 | 0.093 | 0.025 |
| 3.584999999999861 | 0.779 | 0.093 | 0.025 |
| 3.589999999999861 | 0.779 | 0.093 | 0.025 |
| 3.594999999999861 | 0.779 | 0.093 | 0.025 |
| 3.599999999999861 | 0.779 | 0.093 | 0.025 |
| 3.604999999999861 | 0.779 | 0.093 | 0.025 |
| 3.609999999999861 | 0.779 | 0.093 | 0.025 |
| 3.614999999999861 | 0.779 | 0.093 | 0.025 |
| 3.619999999999861 | 0.779 | 0.093 | 0.025 |
| 3.62499999999986 | 0.779 | 0.093 | 0.025 |
| 3.62999999999986 | 0.779 | 0.093 | 0.025 |
| 3.63499999999986 | 0.779 | 0.093 | 0.025 |
| 3.63999999999986 | 0.779 | 0.093 | 0.025 |
| 3.64499999999986 | 0.779 | 0.093 | 0.025 |
| 3.64999999999986 | 0.779 | 0.093 | 0.025 |
| 3.65499999999986 | 0.779 | 0.093 | 0.025 |
| 3.65999999999986 | 0.779 | 0.093 | 0.025 |
| 3.66499999999986 | 0.779 | 0.093 | 0.025 |
| 3.669999999999859 | 0.779 | 0.093 | 0.025 |
| 3.674999999999859 | 0.779 | 0.093 | 0.025 |
| 3.679999999999859 | 0.779 | 0.093 | 0.025 |
| 3.684999999999859 | 0.779 | 0.093 | 0.026 |
| 3.689999999999859 | 0.779 | 0.093 | 0.026 |
| 3.694999999999859 | 0.779 | 0.093 | 0.026 |
| 3.699999999999859 | 0.779 | 0.093 | 0.026 |
| 3.704999999999859 | 0.779 | 0.093 | 0.026 |
| 3.709999999999859 | 0.779 | 0.093 | 0.026 |
| 3.714999999999859 | 0.779 | 0.093 | 0.026 |
| 3.719999999999858 | 0.779 | 0.093 | 0.026 |
| 3.724999999999858 | 0.779 | 0.093 | 0.026 |
| 3.729999999999858 | 0.779 | 0.093 | 0.026 |
| 3.734999999999858 | 0.78 | 0.093 | 0.026 |
| 3.739999999999858 | 0.78 | 0.093 | 0.026 |
| 3.744999999999858 | 0.78 | 0.093 | 0.026 |
| 3.749999999999858 | 0.78 | 0.094 | 0.026 |
| 3.754999999999858 | 0.78 | 0.094 | 0.026 |
| 3.759999999999858 | 0.78 | 0.094 | 0.026 |
| 3.764999999999857 | 0.78 | 0.094 | 0.026 |
| 3.769999999999857 | 0.78 | 0.094 | 0.026 |
| 3.774999999999857 | 0.78 | 0.094 | 0.026 |
| 3.779999999999857 | 0.78 | 0.094 | 0.026 |
| 3.784999999999857 | 0.78 | 0.094 | 0.026 |
| 3.789999999999857 | 0.78 | 0.094 | 0.026 |
| 3.794999999999857 | 0.78 | 0.094 | 0.026 |
| 3.799999999999857 | 0.78 | 0.094 | 0.026 |
| 3.804999999999857 | 0.78 | 0.094 | 0.026 |
| 3.809999999999857 | 0.78 | 0.094 | 0.026 |
| 3.814999999999856 | 0.78 | 0.094 | 0.026 |
| 3.819999999999856 | 0.78 | 0.094 | 0.026 |
| 3.824999999999856 | 0.78 | 0.094 | 0.026 |
| 3.829999999999856 | 0.78 | 0.094 | 0.026 |
| 3.834999999999856 | 0.78 | 0.094 | 0.026 |
| 3.839999999999856 | 0.78 | 0.094 | 0.026 |
| 3.844999999999856 | 0.78 | 0.094 | 0.026 |
| 3.849999999999856 | 0.78 | 0.094 | 0.026 |
| 3.854999999999856 | 0.78 | 0.094 | 0.026 |
| 3.859999999999855 | 0.78 | 0.094 | 0.026 |
| 3.864999999999855 | 0.78 | 0.094 | 0.026 |
| 3.869999999999855 | 0.78 | 0.094 | 0.026 |
| 3.874999999999855 | 0.78 | 0.094 | 0.026 |
| 3.879999999999855 | 0.78 | 0.094 | 0.026 |
| 3.884999999999855 | 0.78 | 0.094 | 0.026 |
| 3.889999999999855 | 0.78 | 0.094 | 0.026 |
| 3.894999999999855 | 0.78 | 0.094 | 0.026 |
| 3.899999999999855 | 0.78 | 0.094 | 0.026 |
| 3.904999999999855 | 0.78 | 0.094 | 0.026 |
| 3.909999999999854 | 0.78 | 0.094 | 0.026 |
| 3.914999999999854 | 0.78 | 0.094 | 0.026 |
| 3.919999999999854 | 0.78 | 0.094 | 0.026 |
| 3.924999999999854 | 0.78 | 0.094 | 0.026 |
| 3.929999999999854 | 0.78 | 0.094 | 0.026 |
| 3.934999999999854 | 0.78 | 0.094 | 0.026 |
| 3.939999999999854 | 0.78 | 0.094 | 0.026 |
| 3.944999999999854 | 0.78 | 0.094 | 0.026 |
| 3.949999999999854 | 0.78 | 0.094 | 0.026 |
| 3.954999999999853 | 0.78 | 0.094 | 0.026 |
| 3.959999999999853 | 0.78 | 0.094 | 0.026 |
| 3.964999999999853 | 0.78 | 0.094 | 0.026 |
| 3.969999999999853 | 0.78 | 0.094 | 0.026 |
| 3.974999999999853 | 0.78 | 0.094 | 0.026 |
| 3.979999999999853 | 0.78 | 0.094 | 0.026 |
| 3.984999999999853 | 0.781 | 0.094 | 0.026 |
| 3.989999999999853 | 0.781 | 0.094 | 0.026 |
| 3.994999999999853 | 0.781 | 0.094 | 0.026 |
| 3.999999999999853 | 0.781 | 0.094 | 0.026 |
| 4.004999999999852 | 0.781 | 0.094 | 0.026 |
| 4.009999999999852 | 0.781 | 0.094 | 0.026 |
| 4.014999999999852 | 0.781 | 0.094 | 0.026 |
| 4.019999999999852 | 0.781 | 0.094 | 0.026 |
| 4.024999999999852 | 0.781 | 0.094 | 0.026 |
| 4.029999999999852 | 0.781 | 0.094 | 0.026 |
| 4.034999999999852 | 0.781 | 0.094 | 0.026 |
| 4.039999999999851 | 0.781 | 0.094 | 0.026 |
| 4.044999999999852 | 0.781 | 0.094 | 0.026 |
| 4.049999999999851 | 0.781 | 0.094 | 0.026 |
| 4.054999999999851 | 0.781 | 0.094 | 0.026 |
| 4.059999999999851 | 0.781 | 0.094 | 0.026 |
| 4.064999999999851 | 0.781 | 0.094 | 0.026 |
| 4.069999999999851 | 0.781 | 0.094 | 0.026 |
| 4.074999999999851 | 0.781 | 0.094 | 0.026 |
| 4.07999999999985 | 0.781 | 0.094 | 0.026 |
| 4.084999999999851 | 0.781 | 0.094 | 0.026 |
| 4.08999999999985 | 0.781 | 0.094 | 0.026 |
| 4.094999999999851 | 0.781 | 0.094 | 0.026 |
| 4.09999999999985 | 0.781 | 0.094 | 0.026 |
| 4.10499999999985 | 0.781 | 0.094 | 0.026 |
| 4.10999999999985 | 0.781 | 0.094 | 0.026 |
| 4.11499999999985 | 0.781 | 0.094 | 0.026 |
| 4.11999999999985 | 0.781 | 0.094 | 0.026 |
| 4.12499999999985 | 0.781 | 0.094 | 0.026 |
| 4.12999999999985 | 0.781 | 0.095 | 0.026 |
| 4.13499999999985 | 0.781 | 0.095 | 0.026 |
| 4.13999999999985 | 0.781 | 0.095 | 0.026 |
| 4.144999999999849 | 0.781 | 0.095 | 0.026 |
| 4.14999999999985 | 0.781 | 0.095 | 0.026 |
| 4.154999999999849 | 0.781 | 0.095 | 0.026 |
| 4.15999999999985 | 0.781 | 0.095 | 0.026 |
| 4.164999999999849 | 0.781 | 0.095 | 0.026 |
| 4.169999999999849 | 0.781 | 0.095 | 0.026 |
| 4.174999999999849 | 0.781 | 0.095 | 0.026 |
| 4.179999999999848 | 0.781 | 0.095 | 0.026 |
| 4.184999999999849 | 0.781 | 0.095 | 0.026 |
| 4.189999999999848 | 0.781 | 0.095 | 0.026 |
| 4.194999999999848 | 0.781 | 0.095 | 0.026 |
| 4.199999999999848 | 0.781 | 0.095 | 0.026 |
| 4.204999999999848 | 0.781 | 0.095 | 0.026 |
| 4.209999999999848 | 0.781 | 0.095 | 0.026 |
| 4.214999999999848 | 0.781 | 0.095 | 0.026 |
| 4.219999999999847 | 0.781 | 0.095 | 0.026 |
| 4.224999999999848 | 0.781 | 0.095 | 0.026 |
| 4.229999999999847 | 0.781 | 0.095 | 0.026 |
| 4.234999999999847 | 0.781 | 0.095 | 0.026 |
| 4.239999999999847 | 0.781 | 0.095 | 0.026 |
| 4.244999999999847 | 0.781 | 0.095 | 0.026 |
| 4.249999999999847 | 0.781 | 0.095 | 0.026 |
| 4.254999999999847 | 0.781 | 0.095 | 0.026 |
| 4.259999999999846 | 0.781 | 0.095 | 0.026 |
| 4.264999999999847 | 0.781 | 0.095 | 0.026 |
| 4.269999999999846 | 0.781 | 0.095 | 0.026 |
| 4.274999999999846 | 0.781 | 0.095 | 0.026 |
| 4.279999999999846 | 0.781 | 0.095 | 0.026 |
| 4.284999999999846 | 0.781 | 0.095 | 0.026 |
| 4.289999999999846 | 0.781 | 0.095 | 0.026 |
| 4.294999999999846 | 0.781 | 0.095 | 0.026 |
| 4.299999999999846 | 0.781 | 0.095 | 0.026 |
| 4.304999999999846 | 0.781 | 0.095 | 0.027 |
| 4.309999999999845 | 0.781 | 0.095 | 0.027 |
| 4.314999999999846 | 0.782 | 0.095 | 0.027 |
| 4.319999999999845 | 0.782 | 0.095 | 0.027 |
| 4.324999999999846 | 0.782 | 0.095 | 0.027 |
| 4.329999999999845 | 0.782 | 0.095 | 0.027 |
| 4.334999999999845 | 0.782 | 0.095 | 0.027 |
| 4.339999999999845 | 0.782 | 0.095 | 0.027 |
| 4.344999999999845 | 0.782 | 0.095 | 0.027 |
| 4.349999999999845 | 0.782 | 0.095 | 0.027 |
| 4.354999999999845 | 0.782 | 0.095 | 0.027 |
| 4.359999999999844 | 0.782 | 0.095 | 0.027 |
| 4.364999999999845 | 0.782 | 0.095 | 0.027 |
| 4.369999999999844 | 0.782 | 0.095 | 0.027 |
| 4.374999999999844 | 0.782 | 0.095 | 0.027 |
| 4.379999999999844 | 0.782 | 0.095 | 0.027 |
| 4.384999999999844 | 0.782 | 0.095 | 0.027 |
| 4.389999999999844 | 0.782 | 0.095 | 0.027 |
| 4.394999999999844 | 0.782 | 0.095 | 0.027 |
| 4.399999999999844 | 0.782 | 0.095 | 0.027 |
| 4.404999999999844 | 0.782 | 0.095 | 0.027 |
| 4.409999999999843 | 0.782 | 0.095 | 0.027 |
| 4.414999999999844 | 0.782 | 0.095 | 0.027 |
| 4.419999999999843 | 0.782 | 0.095 | 0.027 |
| 4.424999999999843 | 0.782 | 0.095 | 0.027 |
| 4.429999999999843 | 0.782 | 0.095 | 0.027 |
| 4.434999999999843 | 0.782 | 0.095 | 0.027 |
| 4.439999999999843 | 0.782 | 0.095 | 0.027 |
| 4.444999999999843 | 0.782 | 0.095 | 0.027 |
| 4.449999999999842 | 0.782 | 0.095 | 0.027 |
| 4.454999999999843 | 0.782 | 0.095 | 0.027 |
| 4.459999999999842 | 0.782 | 0.095 | 0.027 |
| 4.464999999999843 | 0.782 | 0.095 | 0.027 |
| 4.469999999999842 | 0.782 | 0.095 | 0.027 |
| 4.474999999999842 | 0.782 | 0.095 | 0.027 |
| 4.479999999999842 | 0.782 | 0.095 | 0.027 |
| 4.484999999999842 | 0.782 | 0.095 | 0.027 |
| 4.489999999999842 | 0.782 | 0.095 | 0.027 |
| 4.494999999999842 | 0.782 | 0.095 | 0.027 |
| 4.499999999999841 | 0.782 | 0.095 | 0.027 |
| 4.504999999999842 | 0.782 | 0.095 | 0.027 |
| 4.509999999999841 | 0.782 | 0.095 | 0.027 |
| 4.514999999999842 | 0.782 | 0.095 | 0.027 |
| 4.519999999999841 | 0.782 | 0.095 | 0.027 |
| 4.524999999999841 | 0.782 | 0.095 | 0.027 |
| 4.529999999999841 | 0.782 | 0.095 | 0.027 |
| 4.534999999999841 | 0.782 | 0.095 | 0.027 |
| 4.53999999999984 | 0.782 | 0.095 | 0.027 |
| 4.544999999999841 | 0.782 | 0.095 | 0.027 |
| 4.54999999999984 | 0.782 | 0.095 | 0.027 |
| 4.554999999999841 | 0.782 | 0.095 | 0.027 |
| 4.55999999999984 | 0.782 | 0.095 | 0.027 |
| 4.564999999999841 | 0.782 | 0.095 | 0.027 |
| 4.56999999999984 | 0.782 | 0.095 | 0.027 |
| 4.57499999999984 | 0.782 | 0.095 | 0.027 |
| 4.57999999999984 | 0.782 | 0.095 | 0.027 |
| 4.58499999999984 | 0.782 | 0.095 | 0.027 |
| 4.58999999999984 | 0.782 | 0.095 | 0.027 |
| 4.59499999999984 | 0.782 | 0.095 | 0.027 |
| 4.59999999999984 | 0.782 | 0.095 | 0.027 |
| 4.60499999999984 | 0.782 | 0.095 | 0.027 |
| 4.60999999999984 | 0.782 | 0.095 | 0.027 |
| 4.614999999999839 | 0.782 | 0.095 | 0.027 |
| 4.61999999999984 | 0.782 | 0.095 | 0.027 |
| 4.624999999999839 | 0.782 | 0.095 | 0.027 |
| 4.62999999999984 | 0.782 | 0.095 | 0.027 |
| 4.634999999999839 | 0.782 | 0.095 | 0.027 |
| 4.639999999999838 | 0.782 | 0.095 | 0.027 |
| 4.644999999999839 | 0.782 | 0.095 | 0.027 |
| 4.649999999999838 | 0.782 | 0.095 | 0.027 |
| 4.654999999999839 | 0.782 | 0.095 | 0.027 |
| 4.659999999999838 | 0.782 | 0.095 | 0.027 |
| 4.664999999999838 | 0.782 | 0.095 | 0.027 |
| 4.669999999999838 | 0.782 | 0.096 | 0.027 |
| 4.674999999999838 | 0.782 | 0.096 | 0.027 |
| 4.679999999999837 | 0.782 | 0.096 | 0.027 |
| 4.684999999999838 | 0.782 | 0.096 | 0.027 |
| 4.689999999999837 | 0.782 | 0.096 | 0.027 |
| 4.694999999999838 | 0.782 | 0.096 | 0.027 |
| 4.699999999999837 | 0.782 | 0.096 | 0.027 |
| 4.704999999999837 | 0.782 | 0.096 | 0.027 |
| 4.709999999999837 | 0.782 | 0.096 | 0.027 |
| 4.714999999999837 | 0.782 | 0.096 | 0.027 |
| 4.719999999999837 | 0.782 | 0.096 | 0.027 |
| 4.724999999999837 | 0.782 | 0.096 | 0.027 |
| 4.729999999999836 | 0.782 | 0.096 | 0.027 |
| 4.734999999999836 | 0.782 | 0.096 | 0.027 |
| 4.739999999999836 | 0.782 | 0.096 | 0.027 |
| 4.744999999999836 | 0.782 | 0.096 | 0.027 |
| 4.749999999999836 | 0.782 | 0.096 | 0.027 |
| 4.754999999999836 | 0.782 | 0.096 | 0.027 |
| 4.759999999999836 | 0.782 | 0.096 | 0.027 |
| 4.764999999999836 | 0.782 | 0.096 | 0.027 |
| 4.769999999999836 | 0.782 | 0.096 | 0.027 |
| 4.774999999999835 | 0.782 | 0.096 | 0.027 |
| 4.779999999999835 | 0.782 | 0.096 | 0.027 |
| 4.784999999999835 | 0.783 | 0.096 | 0.027 |
| 4.789999999999835 | 0.783 | 0.096 | 0.027 |
| 4.794999999999835 | 0.783 | 0.096 | 0.027 |
| 4.799999999999835 | 0.783 | 0.096 | 0.027 |
| 4.804999999999835 | 0.783 | 0.096 | 0.027 |
| 4.809999999999835 | 0.783 | 0.096 | 0.027 |
| 4.814999999999835 | 0.783 | 0.096 | 0.027 |
| 4.819999999999835 | 0.783 | 0.096 | 0.027 |
| 4.824999999999835 | 0.783 | 0.096 | 0.027 |
| 4.829999999999834 | 0.783 | 0.096 | 0.027 |
| 4.834999999999834 | 0.783 | 0.096 | 0.027 |
| 4.839999999999834 | 0.783 | 0.096 | 0.027 |
| 4.844999999999834 | 0.783 | 0.096 | 0.027 |
| 4.849999999999834 | 0.783 | 0.096 | 0.027 |
| 4.854999999999834 | 0.783 | 0.096 | 0.027 |
| 4.859999999999834 | 0.783 | 0.096 | 0.027 |
| 4.864999999999834 | 0.783 | 0.096 | 0.027 |
| 4.869999999999834 | 0.783 | 0.096 | 0.027 |
| 4.874999999999834 | 0.783 | 0.096 | 0.027 |
| 4.879999999999833 | 0.783 | 0.096 | 0.027 |
| 4.884999999999834 | 0.783 | 0.096 | 0.027 |
| 4.889999999999833 | 0.783 | 0.096 | 0.027 |
| 4.894999999999833 | 0.783 | 0.096 | 0.027 |
| 4.899999999999833 | 0.783 | 0.096 | 0.027 |
| 4.904999999999833 | 0.783 | 0.096 | 0.027 |
| 4.909999999999833 | 0.783 | 0.096 | 0.027 |
| 4.914999999999833 | 0.783 | 0.096 | 0.027 |
| 4.919999999999832 | 0.783 | 0.096 | 0.027 |
| 4.924999999999833 | 0.783 | 0.096 | 0.027 |
| 4.929999999999832 | 0.783 | 0.096 | 0.027 |
| 4.934999999999832 | 0.783 | 0.096 | 0.027 |
| 4.939999999999832 | 0.783 | 0.096 | 0.027 |
| 4.944999999999832 | 0.783 | 0.096 | 0.027 |
| 4.949999999999832 | 0.783 | 0.096 | 0.027 |
| 4.954999999999832 | 0.783 | 0.096 | 0.027 |
| 4.959999999999832 | 0.783 | 0.096 | 0.027 |
| 4.964999999999832 | 0.783 | 0.096 | 0.027 |
| 4.969999999999831 | 0.783 | 0.096 | 0.027 |
| 4.974999999999831 | 0.783 | 0.096 | 0.027 |
| 4.97999999999983 | 0.783 | 0.096 | 0.027 |
| 4.984999999999831 | 0.783 | 0.096 | 0.027 |
| 4.98999999999983 | 0.783 | 0.096 | 0.027 |
| 4.994999999999831 | 0.783 | 0.096 | 0.027 |
| 4.99999999999983 | 0.783 | 0.096 | 0.027 |